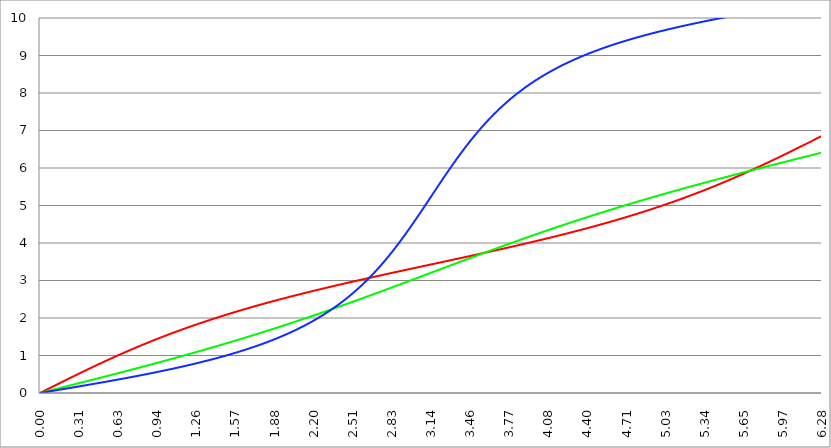
| Category | Series 1 | Series 0 | Series 2 |
|---|---|---|---|
| 0.0 | 0 | 0 | 0 |
| 0.00314159265358979 | 0.005 | 0.003 | 0.002 |
| 0.00628318530717958 | 0.01 | 0.005 | 0.003 |
| 0.00942477796076938 | 0.016 | 0.008 | 0.005 |
| 0.0125663706143592 | 0.021 | 0.01 | 0.007 |
| 0.015707963267949 | 0.026 | 0.013 | 0.009 |
| 0.0188495559215388 | 0.031 | 0.016 | 0.01 |
| 0.0219911485751285 | 0.037 | 0.018 | 0.012 |
| 0.0251327412287183 | 0.042 | 0.021 | 0.014 |
| 0.0282743338823081 | 0.047 | 0.024 | 0.016 |
| 0.0314159265358979 | 0.052 | 0.026 | 0.017 |
| 0.0345575191894877 | 0.058 | 0.029 | 0.019 |
| 0.0376991118430775 | 0.063 | 0.031 | 0.021 |
| 0.0408407044966673 | 0.068 | 0.034 | 0.023 |
| 0.0439822971502571 | 0.073 | 0.037 | 0.024 |
| 0.0471238898038469 | 0.079 | 0.039 | 0.026 |
| 0.0502654824574367 | 0.084 | 0.042 | 0.028 |
| 0.0534070751110265 | 0.089 | 0.045 | 0.03 |
| 0.0565486677646163 | 0.094 | 0.047 | 0.031 |
| 0.059690260418206 | 0.099 | 0.05 | 0.033 |
| 0.0628318530717958 | 0.105 | 0.052 | 0.035 |
| 0.0659734457253856 | 0.11 | 0.055 | 0.037 |
| 0.0691150383789754 | 0.115 | 0.058 | 0.038 |
| 0.0722566310325652 | 0.12 | 0.06 | 0.04 |
| 0.075398223686155 | 0.126 | 0.063 | 0.042 |
| 0.0785398163397448 | 0.131 | 0.065 | 0.044 |
| 0.0816814089933346 | 0.136 | 0.068 | 0.045 |
| 0.0848230016469244 | 0.141 | 0.071 | 0.047 |
| 0.0879645943005142 | 0.146 | 0.073 | 0.049 |
| 0.091106186954104 | 0.152 | 0.076 | 0.051 |
| 0.0942477796076937 | 0.157 | 0.079 | 0.052 |
| 0.0973893722612835 | 0.162 | 0.081 | 0.054 |
| 0.100530964914873 | 0.167 | 0.084 | 0.056 |
| 0.103672557568463 | 0.173 | 0.086 | 0.058 |
| 0.106814150222053 | 0.178 | 0.089 | 0.059 |
| 0.109955742875643 | 0.183 | 0.092 | 0.061 |
| 0.113097335529233 | 0.188 | 0.094 | 0.063 |
| 0.116238928182822 | 0.193 | 0.097 | 0.065 |
| 0.119380520836412 | 0.199 | 0.1 | 0.066 |
| 0.122522113490002 | 0.204 | 0.102 | 0.068 |
| 0.125663706143592 | 0.209 | 0.105 | 0.07 |
| 0.128805298797181 | 0.214 | 0.107 | 0.072 |
| 0.131946891450771 | 0.219 | 0.11 | 0.073 |
| 0.135088484104361 | 0.225 | 0.113 | 0.075 |
| 0.138230076757951 | 0.23 | 0.115 | 0.077 |
| 0.141371669411541 | 0.235 | 0.118 | 0.079 |
| 0.14451326206513 | 0.24 | 0.12 | 0.08 |
| 0.14765485471872 | 0.245 | 0.123 | 0.082 |
| 0.15079644737231 | 0.251 | 0.126 | 0.084 |
| 0.1539380400259 | 0.256 | 0.128 | 0.086 |
| 0.15707963267949 | 0.261 | 0.131 | 0.087 |
| 0.160221225333079 | 0.266 | 0.134 | 0.089 |
| 0.163362817986669 | 0.271 | 0.136 | 0.091 |
| 0.166504410640259 | 0.277 | 0.139 | 0.093 |
| 0.169646003293849 | 0.282 | 0.141 | 0.094 |
| 0.172787595947439 | 0.287 | 0.144 | 0.096 |
| 0.175929188601028 | 0.292 | 0.147 | 0.098 |
| 0.179070781254618 | 0.297 | 0.149 | 0.1 |
| 0.182212373908208 | 0.303 | 0.152 | 0.101 |
| 0.185353966561798 | 0.308 | 0.155 | 0.103 |
| 0.188495559215388 | 0.313 | 0.157 | 0.105 |
| 0.191637151868977 | 0.318 | 0.16 | 0.107 |
| 0.194778744522567 | 0.323 | 0.162 | 0.109 |
| 0.197920337176157 | 0.328 | 0.165 | 0.11 |
| 0.201061929829747 | 0.334 | 0.168 | 0.112 |
| 0.204203522483336 | 0.339 | 0.17 | 0.114 |
| 0.207345115136926 | 0.344 | 0.173 | 0.116 |
| 0.210486707790516 | 0.349 | 0.176 | 0.117 |
| 0.213628300444106 | 0.354 | 0.178 | 0.119 |
| 0.216769893097696 | 0.359 | 0.181 | 0.121 |
| 0.219911485751285 | 0.365 | 0.184 | 0.123 |
| 0.223053078404875 | 0.37 | 0.186 | 0.124 |
| 0.226194671058465 | 0.375 | 0.189 | 0.126 |
| 0.229336263712055 | 0.38 | 0.191 | 0.128 |
| 0.232477856365645 | 0.385 | 0.194 | 0.13 |
| 0.235619449019234 | 0.39 | 0.197 | 0.131 |
| 0.238761041672824 | 0.395 | 0.199 | 0.133 |
| 0.241902634326414 | 0.401 | 0.202 | 0.135 |
| 0.245044226980004 | 0.406 | 0.205 | 0.137 |
| 0.248185819633594 | 0.411 | 0.207 | 0.139 |
| 0.251327412287183 | 0.416 | 0.21 | 0.14 |
| 0.254469004940773 | 0.421 | 0.212 | 0.142 |
| 0.257610597594363 | 0.426 | 0.215 | 0.144 |
| 0.260752190247953 | 0.431 | 0.218 | 0.146 |
| 0.263893782901543 | 0.436 | 0.22 | 0.147 |
| 0.267035375555132 | 0.442 | 0.223 | 0.149 |
| 0.270176968208722 | 0.447 | 0.226 | 0.151 |
| 0.273318560862312 | 0.452 | 0.228 | 0.153 |
| 0.276460153515902 | 0.457 | 0.231 | 0.154 |
| 0.279601746169492 | 0.462 | 0.234 | 0.156 |
| 0.282743338823082 | 0.467 | 0.236 | 0.158 |
| 0.285884931476671 | 0.472 | 0.239 | 0.16 |
| 0.289026524130261 | 0.477 | 0.241 | 0.162 |
| 0.292168116783851 | 0.482 | 0.244 | 0.163 |
| 0.295309709437441 | 0.488 | 0.247 | 0.165 |
| 0.298451302091031 | 0.493 | 0.249 | 0.167 |
| 0.30159289474462 | 0.498 | 0.252 | 0.169 |
| 0.30473448739821 | 0.503 | 0.255 | 0.17 |
| 0.3078760800518 | 0.508 | 0.257 | 0.172 |
| 0.31101767270539 | 0.513 | 0.26 | 0.174 |
| 0.31415926535898 | 0.518 | 0.263 | 0.176 |
| 0.31730085801257 | 0.523 | 0.265 | 0.178 |
| 0.320442450666159 | 0.528 | 0.268 | 0.179 |
| 0.323584043319749 | 0.533 | 0.27 | 0.181 |
| 0.326725635973339 | 0.538 | 0.273 | 0.183 |
| 0.329867228626929 | 0.543 | 0.276 | 0.185 |
| 0.333008821280519 | 0.548 | 0.278 | 0.187 |
| 0.336150413934108 | 0.553 | 0.281 | 0.188 |
| 0.339292006587698 | 0.558 | 0.284 | 0.19 |
| 0.342433599241288 | 0.563 | 0.286 | 0.192 |
| 0.345575191894878 | 0.569 | 0.289 | 0.194 |
| 0.348716784548468 | 0.574 | 0.292 | 0.195 |
| 0.351858377202058 | 0.579 | 0.294 | 0.197 |
| 0.354999969855647 | 0.584 | 0.297 | 0.199 |
| 0.358141562509237 | 0.589 | 0.3 | 0.201 |
| 0.361283155162827 | 0.594 | 0.302 | 0.203 |
| 0.364424747816417 | 0.599 | 0.305 | 0.204 |
| 0.367566340470007 | 0.604 | 0.307 | 0.206 |
| 0.370707933123597 | 0.609 | 0.31 | 0.208 |
| 0.373849525777186 | 0.614 | 0.313 | 0.21 |
| 0.376991118430776 | 0.619 | 0.315 | 0.212 |
| 0.380132711084366 | 0.624 | 0.318 | 0.213 |
| 0.383274303737956 | 0.629 | 0.321 | 0.215 |
| 0.386415896391546 | 0.634 | 0.323 | 0.217 |
| 0.389557489045135 | 0.639 | 0.326 | 0.219 |
| 0.392699081698725 | 0.644 | 0.329 | 0.221 |
| 0.395840674352315 | 0.649 | 0.331 | 0.222 |
| 0.398982267005905 | 0.654 | 0.334 | 0.224 |
| 0.402123859659495 | 0.659 | 0.337 | 0.226 |
| 0.405265452313085 | 0.664 | 0.339 | 0.228 |
| 0.408407044966674 | 0.669 | 0.342 | 0.23 |
| 0.411548637620264 | 0.674 | 0.345 | 0.232 |
| 0.414690230273854 | 0.678 | 0.347 | 0.233 |
| 0.417831822927444 | 0.683 | 0.35 | 0.235 |
| 0.420973415581034 | 0.688 | 0.353 | 0.237 |
| 0.424115008234623 | 0.693 | 0.355 | 0.239 |
| 0.427256600888213 | 0.698 | 0.358 | 0.241 |
| 0.430398193541803 | 0.703 | 0.361 | 0.242 |
| 0.433539786195393 | 0.708 | 0.363 | 0.244 |
| 0.436681378848983 | 0.713 | 0.366 | 0.246 |
| 0.439822971502573 | 0.718 | 0.368 | 0.248 |
| 0.442964564156162 | 0.723 | 0.371 | 0.25 |
| 0.446106156809752 | 0.728 | 0.374 | 0.252 |
| 0.449247749463342 | 0.733 | 0.376 | 0.253 |
| 0.452389342116932 | 0.738 | 0.379 | 0.255 |
| 0.455530934770522 | 0.743 | 0.382 | 0.257 |
| 0.458672527424111 | 0.747 | 0.384 | 0.259 |
| 0.461814120077701 | 0.752 | 0.387 | 0.261 |
| 0.464955712731291 | 0.757 | 0.39 | 0.263 |
| 0.468097305384881 | 0.762 | 0.392 | 0.264 |
| 0.471238898038471 | 0.767 | 0.395 | 0.266 |
| 0.474380490692061 | 0.772 | 0.398 | 0.268 |
| 0.47752208334565 | 0.777 | 0.4 | 0.27 |
| 0.48066367599924 | 0.782 | 0.403 | 0.272 |
| 0.48380526865283 | 0.787 | 0.406 | 0.274 |
| 0.48694686130642 | 0.791 | 0.408 | 0.275 |
| 0.49008845396001 | 0.796 | 0.411 | 0.277 |
| 0.493230046613599 | 0.801 | 0.414 | 0.279 |
| 0.496371639267189 | 0.806 | 0.416 | 0.281 |
| 0.499513231920779 | 0.811 | 0.419 | 0.283 |
| 0.502654824574369 | 0.816 | 0.422 | 0.285 |
| 0.505796417227959 | 0.82 | 0.424 | 0.286 |
| 0.508938009881549 | 0.825 | 0.427 | 0.288 |
| 0.512079602535138 | 0.83 | 0.43 | 0.29 |
| 0.515221195188728 | 0.835 | 0.433 | 0.292 |
| 0.518362787842318 | 0.84 | 0.435 | 0.294 |
| 0.521504380495908 | 0.845 | 0.438 | 0.296 |
| 0.524645973149498 | 0.849 | 0.441 | 0.298 |
| 0.527787565803087 | 0.854 | 0.443 | 0.299 |
| 0.530929158456677 | 0.859 | 0.446 | 0.301 |
| 0.534070751110267 | 0.864 | 0.449 | 0.303 |
| 0.537212343763857 | 0.869 | 0.451 | 0.305 |
| 0.540353936417447 | 0.873 | 0.454 | 0.307 |
| 0.543495529071037 | 0.878 | 0.457 | 0.309 |
| 0.546637121724626 | 0.883 | 0.459 | 0.311 |
| 0.549778714378216 | 0.888 | 0.462 | 0.312 |
| 0.552920307031806 | 0.892 | 0.465 | 0.314 |
| 0.556061899685396 | 0.897 | 0.467 | 0.316 |
| 0.559203492338986 | 0.902 | 0.47 | 0.318 |
| 0.562345084992576 | 0.907 | 0.473 | 0.32 |
| 0.565486677646165 | 0.911 | 0.475 | 0.322 |
| 0.568628270299755 | 0.916 | 0.478 | 0.324 |
| 0.571769862953345 | 0.921 | 0.481 | 0.326 |
| 0.574911455606935 | 0.926 | 0.483 | 0.327 |
| 0.578053048260525 | 0.93 | 0.486 | 0.329 |
| 0.581194640914114 | 0.935 | 0.489 | 0.331 |
| 0.584336233567704 | 0.94 | 0.492 | 0.333 |
| 0.587477826221294 | 0.945 | 0.494 | 0.335 |
| 0.590619418874884 | 0.949 | 0.497 | 0.337 |
| 0.593761011528474 | 0.954 | 0.5 | 0.339 |
| 0.596902604182064 | 0.959 | 0.502 | 0.341 |
| 0.600044196835653 | 0.963 | 0.505 | 0.343 |
| 0.603185789489243 | 0.968 | 0.508 | 0.344 |
| 0.606327382142833 | 0.973 | 0.51 | 0.346 |
| 0.609468974796423 | 0.977 | 0.513 | 0.348 |
| 0.612610567450013 | 0.982 | 0.516 | 0.35 |
| 0.615752160103602 | 0.987 | 0.519 | 0.352 |
| 0.618893752757192 | 0.991 | 0.521 | 0.354 |
| 0.622035345410782 | 0.996 | 0.524 | 0.356 |
| 0.625176938064372 | 1.001 | 0.527 | 0.358 |
| 0.628318530717962 | 1.005 | 0.529 | 0.36 |
| 0.631460123371551 | 1.01 | 0.532 | 0.362 |
| 0.634601716025141 | 1.015 | 0.535 | 0.363 |
| 0.637743308678731 | 1.019 | 0.537 | 0.365 |
| 0.640884901332321 | 1.024 | 0.54 | 0.367 |
| 0.644026493985911 | 1.028 | 0.543 | 0.369 |
| 0.647168086639501 | 1.033 | 0.546 | 0.371 |
| 0.65030967929309 | 1.038 | 0.548 | 0.373 |
| 0.65345127194668 | 1.042 | 0.551 | 0.375 |
| 0.65659286460027 | 1.047 | 0.554 | 0.377 |
| 0.65973445725386 | 1.052 | 0.556 | 0.379 |
| 0.66287604990745 | 1.056 | 0.559 | 0.381 |
| 0.666017642561039 | 1.061 | 0.562 | 0.383 |
| 0.669159235214629 | 1.065 | 0.565 | 0.385 |
| 0.672300827868219 | 1.07 | 0.567 | 0.386 |
| 0.675442420521809 | 1.074 | 0.57 | 0.388 |
| 0.678584013175399 | 1.079 | 0.573 | 0.39 |
| 0.681725605828989 | 1.084 | 0.575 | 0.392 |
| 0.684867198482578 | 1.088 | 0.578 | 0.394 |
| 0.688008791136168 | 1.093 | 0.581 | 0.396 |
| 0.691150383789758 | 1.097 | 0.584 | 0.398 |
| 0.694291976443348 | 1.102 | 0.586 | 0.4 |
| 0.697433569096938 | 1.106 | 0.589 | 0.402 |
| 0.700575161750528 | 1.111 | 0.592 | 0.404 |
| 0.703716754404117 | 1.115 | 0.594 | 0.406 |
| 0.706858347057707 | 1.12 | 0.597 | 0.408 |
| 0.709999939711297 | 1.124 | 0.6 | 0.41 |
| 0.713141532364887 | 1.129 | 0.603 | 0.412 |
| 0.716283125018477 | 1.133 | 0.605 | 0.414 |
| 0.719424717672066 | 1.138 | 0.608 | 0.416 |
| 0.722566310325656 | 1.142 | 0.611 | 0.418 |
| 0.725707902979246 | 1.147 | 0.614 | 0.42 |
| 0.728849495632836 | 1.151 | 0.616 | 0.422 |
| 0.731991088286426 | 1.156 | 0.619 | 0.424 |
| 0.735132680940016 | 1.16 | 0.622 | 0.426 |
| 0.738274273593605 | 1.165 | 0.625 | 0.427 |
| 0.741415866247195 | 1.169 | 0.627 | 0.429 |
| 0.744557458900785 | 1.174 | 0.63 | 0.431 |
| 0.747699051554375 | 1.178 | 0.633 | 0.433 |
| 0.750840644207965 | 1.183 | 0.635 | 0.435 |
| 0.753982236861554 | 1.187 | 0.638 | 0.437 |
| 0.757123829515144 | 1.191 | 0.641 | 0.439 |
| 0.760265422168734 | 1.196 | 0.644 | 0.441 |
| 0.763407014822324 | 1.2 | 0.646 | 0.443 |
| 0.766548607475914 | 1.205 | 0.649 | 0.445 |
| 0.769690200129504 | 1.209 | 0.652 | 0.447 |
| 0.772831792783093 | 1.213 | 0.655 | 0.449 |
| 0.775973385436683 | 1.218 | 0.657 | 0.451 |
| 0.779114978090273 | 1.222 | 0.66 | 0.453 |
| 0.782256570743863 | 1.227 | 0.663 | 0.455 |
| 0.785398163397453 | 1.231 | 0.666 | 0.457 |
| 0.788539756051042 | 1.235 | 0.668 | 0.459 |
| 0.791681348704632 | 1.24 | 0.671 | 0.461 |
| 0.794822941358222 | 1.244 | 0.674 | 0.463 |
| 0.797964534011812 | 1.249 | 0.677 | 0.465 |
| 0.801106126665402 | 1.253 | 0.679 | 0.467 |
| 0.804247719318992 | 1.257 | 0.682 | 0.469 |
| 0.807389311972581 | 1.262 | 0.685 | 0.471 |
| 0.810530904626171 | 1.266 | 0.688 | 0.473 |
| 0.813672497279761 | 1.27 | 0.691 | 0.475 |
| 0.816814089933351 | 1.275 | 0.693 | 0.478 |
| 0.819955682586941 | 1.279 | 0.696 | 0.48 |
| 0.823097275240531 | 1.283 | 0.699 | 0.482 |
| 0.82623886789412 | 1.288 | 0.702 | 0.484 |
| 0.82938046054771 | 1.292 | 0.704 | 0.486 |
| 0.8325220532013 | 1.296 | 0.707 | 0.488 |
| 0.83566364585489 | 1.3 | 0.71 | 0.49 |
| 0.83880523850848 | 1.305 | 0.713 | 0.492 |
| 0.841946831162069 | 1.309 | 0.715 | 0.494 |
| 0.845088423815659 | 1.313 | 0.718 | 0.496 |
| 0.848230016469249 | 1.318 | 0.721 | 0.498 |
| 0.851371609122839 | 1.322 | 0.724 | 0.5 |
| 0.854513201776429 | 1.326 | 0.727 | 0.502 |
| 0.857654794430019 | 1.33 | 0.729 | 0.504 |
| 0.860796387083608 | 1.335 | 0.732 | 0.506 |
| 0.863937979737198 | 1.339 | 0.735 | 0.508 |
| 0.867079572390788 | 1.343 | 0.738 | 0.51 |
| 0.870221165044378 | 1.347 | 0.74 | 0.512 |
| 0.873362757697968 | 1.352 | 0.743 | 0.514 |
| 0.876504350351557 | 1.356 | 0.746 | 0.517 |
| 0.879645943005147 | 1.36 | 0.749 | 0.519 |
| 0.882787535658737 | 1.364 | 0.752 | 0.521 |
| 0.885929128312327 | 1.368 | 0.754 | 0.523 |
| 0.889070720965917 | 1.373 | 0.757 | 0.525 |
| 0.892212313619507 | 1.377 | 0.76 | 0.527 |
| 0.895353906273096 | 1.381 | 0.763 | 0.529 |
| 0.898495498926686 | 1.385 | 0.766 | 0.531 |
| 0.901637091580276 | 1.389 | 0.768 | 0.533 |
| 0.904778684233866 | 1.394 | 0.771 | 0.535 |
| 0.907920276887456 | 1.398 | 0.774 | 0.537 |
| 0.911061869541045 | 1.402 | 0.777 | 0.54 |
| 0.914203462194635 | 1.406 | 0.78 | 0.542 |
| 0.917345054848225 | 1.41 | 0.782 | 0.544 |
| 0.920486647501815 | 1.414 | 0.785 | 0.546 |
| 0.923628240155405 | 1.419 | 0.788 | 0.548 |
| 0.926769832808995 | 1.423 | 0.791 | 0.55 |
| 0.929911425462584 | 1.427 | 0.794 | 0.552 |
| 0.933053018116174 | 1.431 | 0.796 | 0.554 |
| 0.936194610769764 | 1.435 | 0.799 | 0.557 |
| 0.939336203423354 | 1.439 | 0.802 | 0.559 |
| 0.942477796076944 | 1.443 | 0.805 | 0.561 |
| 0.945619388730533 | 1.447 | 0.808 | 0.563 |
| 0.948760981384123 | 1.451 | 0.81 | 0.565 |
| 0.951902574037713 | 1.456 | 0.813 | 0.567 |
| 0.955044166691303 | 1.46 | 0.816 | 0.569 |
| 0.958185759344893 | 1.464 | 0.819 | 0.572 |
| 0.961327351998483 | 1.468 | 0.822 | 0.574 |
| 0.964468944652072 | 1.472 | 0.824 | 0.576 |
| 0.967610537305662 | 1.476 | 0.827 | 0.578 |
| 0.970752129959252 | 1.48 | 0.83 | 0.58 |
| 0.973893722612842 | 1.484 | 0.833 | 0.582 |
| 0.977035315266432 | 1.488 | 0.836 | 0.584 |
| 0.980176907920022 | 1.492 | 0.839 | 0.587 |
| 0.983318500573611 | 1.496 | 0.841 | 0.589 |
| 0.986460093227201 | 1.5 | 0.844 | 0.591 |
| 0.989601685880791 | 1.504 | 0.847 | 0.593 |
| 0.992743278534381 | 1.508 | 0.85 | 0.595 |
| 0.995884871187971 | 1.512 | 0.853 | 0.598 |
| 0.99902646384156 | 1.516 | 0.856 | 0.6 |
| 1.00216805649515 | 1.52 | 0.858 | 0.602 |
| 1.00530964914874 | 1.524 | 0.861 | 0.604 |
| 1.00845124180233 | 1.528 | 0.864 | 0.606 |
| 1.01159283445592 | 1.532 | 0.867 | 0.609 |
| 1.01473442710951 | 1.536 | 0.87 | 0.611 |
| 1.017876019763099 | 1.54 | 0.873 | 0.613 |
| 1.021017612416689 | 1.544 | 0.875 | 0.615 |
| 1.02415920507028 | 1.548 | 0.878 | 0.617 |
| 1.027300797723869 | 1.552 | 0.881 | 0.62 |
| 1.030442390377459 | 1.556 | 0.884 | 0.622 |
| 1.033583983031048 | 1.56 | 0.887 | 0.624 |
| 1.036725575684638 | 1.564 | 0.89 | 0.626 |
| 1.039867168338228 | 1.568 | 0.893 | 0.629 |
| 1.043008760991818 | 1.572 | 0.895 | 0.631 |
| 1.046150353645408 | 1.576 | 0.898 | 0.633 |
| 1.049291946298998 | 1.58 | 0.901 | 0.635 |
| 1.052433538952587 | 1.584 | 0.904 | 0.637 |
| 1.055575131606177 | 1.588 | 0.907 | 0.64 |
| 1.058716724259767 | 1.591 | 0.91 | 0.642 |
| 1.061858316913357 | 1.595 | 0.913 | 0.644 |
| 1.064999909566947 | 1.599 | 0.915 | 0.647 |
| 1.068141502220536 | 1.603 | 0.918 | 0.649 |
| 1.071283094874126 | 1.607 | 0.921 | 0.651 |
| 1.074424687527716 | 1.611 | 0.924 | 0.653 |
| 1.077566280181306 | 1.615 | 0.927 | 0.656 |
| 1.080707872834896 | 1.619 | 0.93 | 0.658 |
| 1.083849465488486 | 1.623 | 0.933 | 0.66 |
| 1.086991058142075 | 1.626 | 0.935 | 0.662 |
| 1.090132650795665 | 1.63 | 0.938 | 0.665 |
| 1.093274243449255 | 1.634 | 0.941 | 0.667 |
| 1.096415836102845 | 1.638 | 0.944 | 0.669 |
| 1.099557428756435 | 1.642 | 0.947 | 0.672 |
| 1.102699021410025 | 1.646 | 0.95 | 0.674 |
| 1.105840614063614 | 1.65 | 0.953 | 0.676 |
| 1.108982206717204 | 1.653 | 0.956 | 0.679 |
| 1.112123799370794 | 1.657 | 0.959 | 0.681 |
| 1.115265392024384 | 1.661 | 0.961 | 0.683 |
| 1.118406984677974 | 1.665 | 0.964 | 0.686 |
| 1.121548577331563 | 1.669 | 0.967 | 0.688 |
| 1.124690169985153 | 1.672 | 0.97 | 0.69 |
| 1.127831762638743 | 1.676 | 0.973 | 0.693 |
| 1.130973355292333 | 1.68 | 0.976 | 0.695 |
| 1.134114947945923 | 1.684 | 0.979 | 0.697 |
| 1.137256540599513 | 1.688 | 0.982 | 0.7 |
| 1.140398133253102 | 1.691 | 0.985 | 0.702 |
| 1.143539725906692 | 1.695 | 0.987 | 0.704 |
| 1.146681318560282 | 1.699 | 0.99 | 0.707 |
| 1.149822911213872 | 1.703 | 0.993 | 0.709 |
| 1.152964503867462 | 1.706 | 0.996 | 0.711 |
| 1.156106096521051 | 1.71 | 0.999 | 0.714 |
| 1.159247689174641 | 1.714 | 1.002 | 0.716 |
| 1.162389281828231 | 1.718 | 1.005 | 0.719 |
| 1.165530874481821 | 1.721 | 1.008 | 0.721 |
| 1.168672467135411 | 1.725 | 1.011 | 0.723 |
| 1.171814059789001 | 1.729 | 1.014 | 0.726 |
| 1.17495565244259 | 1.732 | 1.017 | 0.728 |
| 1.17809724509618 | 1.736 | 1.019 | 0.73 |
| 1.18123883774977 | 1.74 | 1.022 | 0.733 |
| 1.18438043040336 | 1.744 | 1.025 | 0.735 |
| 1.18752202305695 | 1.747 | 1.028 | 0.738 |
| 1.190663615710539 | 1.751 | 1.031 | 0.74 |
| 1.193805208364129 | 1.755 | 1.034 | 0.743 |
| 1.19694680101772 | 1.758 | 1.037 | 0.745 |
| 1.200088393671309 | 1.762 | 1.04 | 0.747 |
| 1.203229986324899 | 1.766 | 1.043 | 0.75 |
| 1.206371578978489 | 1.769 | 1.046 | 0.752 |
| 1.209513171632078 | 1.773 | 1.049 | 0.755 |
| 1.212654764285668 | 1.777 | 1.052 | 0.757 |
| 1.215796356939258 | 1.78 | 1.055 | 0.76 |
| 1.218937949592848 | 1.784 | 1.058 | 0.762 |
| 1.222079542246438 | 1.788 | 1.06 | 0.765 |
| 1.225221134900027 | 1.791 | 1.063 | 0.767 |
| 1.228362727553617 | 1.795 | 1.066 | 0.77 |
| 1.231504320207207 | 1.799 | 1.069 | 0.772 |
| 1.234645912860797 | 1.802 | 1.072 | 0.775 |
| 1.237787505514387 | 1.806 | 1.075 | 0.777 |
| 1.240929098167977 | 1.809 | 1.078 | 0.779 |
| 1.244070690821566 | 1.813 | 1.081 | 0.782 |
| 1.247212283475156 | 1.817 | 1.084 | 0.784 |
| 1.250353876128746 | 1.82 | 1.087 | 0.787 |
| 1.253495468782336 | 1.824 | 1.09 | 0.79 |
| 1.256637061435926 | 1.827 | 1.093 | 0.792 |
| 1.259778654089515 | 1.831 | 1.096 | 0.795 |
| 1.262920246743105 | 1.835 | 1.099 | 0.797 |
| 1.266061839396695 | 1.838 | 1.102 | 0.8 |
| 1.269203432050285 | 1.842 | 1.105 | 0.802 |
| 1.272345024703875 | 1.845 | 1.108 | 0.805 |
| 1.275486617357465 | 1.849 | 1.111 | 0.807 |
| 1.278628210011054 | 1.852 | 1.114 | 0.81 |
| 1.281769802664644 | 1.856 | 1.117 | 0.812 |
| 1.284911395318234 | 1.859 | 1.12 | 0.815 |
| 1.288052987971824 | 1.863 | 1.123 | 0.817 |
| 1.291194580625414 | 1.866 | 1.126 | 0.82 |
| 1.294336173279003 | 1.87 | 1.129 | 0.823 |
| 1.297477765932593 | 1.874 | 1.132 | 0.825 |
| 1.300619358586183 | 1.877 | 1.135 | 0.828 |
| 1.303760951239773 | 1.881 | 1.137 | 0.83 |
| 1.306902543893363 | 1.884 | 1.14 | 0.833 |
| 1.310044136546953 | 1.888 | 1.143 | 0.836 |
| 1.313185729200542 | 1.891 | 1.146 | 0.838 |
| 1.316327321854132 | 1.895 | 1.149 | 0.841 |
| 1.319468914507722 | 1.898 | 1.152 | 0.843 |
| 1.322610507161312 | 1.902 | 1.155 | 0.846 |
| 1.325752099814902 | 1.905 | 1.158 | 0.849 |
| 1.328893692468491 | 1.909 | 1.161 | 0.851 |
| 1.332035285122081 | 1.912 | 1.164 | 0.854 |
| 1.335176877775671 | 1.915 | 1.167 | 0.857 |
| 1.338318470429261 | 1.919 | 1.17 | 0.859 |
| 1.341460063082851 | 1.922 | 1.173 | 0.862 |
| 1.344601655736441 | 1.926 | 1.176 | 0.865 |
| 1.34774324839003 | 1.929 | 1.179 | 0.867 |
| 1.35088484104362 | 1.933 | 1.182 | 0.87 |
| 1.35402643369721 | 1.936 | 1.185 | 0.873 |
| 1.3571680263508 | 1.94 | 1.188 | 0.875 |
| 1.36030961900439 | 1.943 | 1.191 | 0.878 |
| 1.363451211657979 | 1.946 | 1.195 | 0.881 |
| 1.36659280431157 | 1.95 | 1.198 | 0.883 |
| 1.369734396965159 | 1.953 | 1.201 | 0.886 |
| 1.372875989618749 | 1.957 | 1.204 | 0.889 |
| 1.376017582272339 | 1.96 | 1.207 | 0.891 |
| 1.379159174925929 | 1.964 | 1.21 | 0.894 |
| 1.382300767579518 | 1.967 | 1.213 | 0.897 |
| 1.385442360233108 | 1.97 | 1.216 | 0.9 |
| 1.388583952886698 | 1.974 | 1.219 | 0.902 |
| 1.391725545540288 | 1.977 | 1.222 | 0.905 |
| 1.394867138193878 | 1.98 | 1.225 | 0.908 |
| 1.398008730847468 | 1.984 | 1.228 | 0.911 |
| 1.401150323501057 | 1.987 | 1.231 | 0.913 |
| 1.404291916154647 | 1.991 | 1.234 | 0.916 |
| 1.407433508808237 | 1.994 | 1.237 | 0.919 |
| 1.410575101461827 | 1.997 | 1.24 | 0.922 |
| 1.413716694115417 | 2.001 | 1.243 | 0.925 |
| 1.416858286769006 | 2.004 | 1.246 | 0.927 |
| 1.419999879422596 | 2.007 | 1.249 | 0.93 |
| 1.423141472076186 | 2.011 | 1.252 | 0.933 |
| 1.426283064729776 | 2.014 | 1.255 | 0.936 |
| 1.429424657383366 | 2.017 | 1.258 | 0.939 |
| 1.432566250036956 | 2.021 | 1.261 | 0.941 |
| 1.435707842690545 | 2.024 | 1.264 | 0.944 |
| 1.438849435344135 | 2.027 | 1.267 | 0.947 |
| 1.441991027997725 | 2.031 | 1.271 | 0.95 |
| 1.445132620651315 | 2.034 | 1.274 | 0.953 |
| 1.448274213304905 | 2.037 | 1.277 | 0.956 |
| 1.451415805958494 | 2.041 | 1.28 | 0.958 |
| 1.454557398612084 | 2.044 | 1.283 | 0.961 |
| 1.457698991265674 | 2.047 | 1.286 | 0.964 |
| 1.460840583919264 | 2.05 | 1.289 | 0.967 |
| 1.463982176572854 | 2.054 | 1.292 | 0.97 |
| 1.467123769226444 | 2.057 | 1.295 | 0.973 |
| 1.470265361880033 | 2.06 | 1.298 | 0.976 |
| 1.473406954533623 | 2.064 | 1.301 | 0.979 |
| 1.476548547187213 | 2.067 | 1.304 | 0.982 |
| 1.479690139840803 | 2.07 | 1.307 | 0.985 |
| 1.482831732494393 | 2.073 | 1.31 | 0.987 |
| 1.485973325147982 | 2.077 | 1.314 | 0.99 |
| 1.489114917801572 | 2.08 | 1.317 | 0.993 |
| 1.492256510455162 | 2.083 | 1.32 | 0.996 |
| 1.495398103108752 | 2.086 | 1.323 | 0.999 |
| 1.498539695762342 | 2.09 | 1.326 | 1.002 |
| 1.501681288415932 | 2.093 | 1.329 | 1.005 |
| 1.504822881069521 | 2.096 | 1.332 | 1.008 |
| 1.507964473723111 | 2.099 | 1.335 | 1.011 |
| 1.511106066376701 | 2.102 | 1.338 | 1.014 |
| 1.514247659030291 | 2.106 | 1.341 | 1.017 |
| 1.517389251683881 | 2.109 | 1.345 | 1.02 |
| 1.520530844337471 | 2.112 | 1.348 | 1.023 |
| 1.52367243699106 | 2.115 | 1.351 | 1.026 |
| 1.52681402964465 | 2.119 | 1.354 | 1.029 |
| 1.52995562229824 | 2.122 | 1.357 | 1.032 |
| 1.53309721495183 | 2.125 | 1.36 | 1.035 |
| 1.53623880760542 | 2.128 | 1.363 | 1.038 |
| 1.539380400259009 | 2.131 | 1.366 | 1.041 |
| 1.542521992912599 | 2.134 | 1.369 | 1.045 |
| 1.545663585566189 | 2.138 | 1.373 | 1.048 |
| 1.548805178219779 | 2.141 | 1.376 | 1.051 |
| 1.551946770873369 | 2.144 | 1.379 | 1.054 |
| 1.555088363526959 | 2.147 | 1.382 | 1.057 |
| 1.558229956180548 | 2.15 | 1.385 | 1.06 |
| 1.561371548834138 | 2.153 | 1.388 | 1.063 |
| 1.564513141487728 | 2.157 | 1.391 | 1.066 |
| 1.567654734141318 | 2.16 | 1.395 | 1.069 |
| 1.570796326794908 | 2.163 | 1.398 | 1.073 |
| 1.573937919448497 | 2.166 | 1.401 | 1.076 |
| 1.577079512102087 | 2.169 | 1.404 | 1.079 |
| 1.580221104755677 | 2.172 | 1.407 | 1.082 |
| 1.583362697409267 | 2.175 | 1.41 | 1.085 |
| 1.586504290062857 | 2.179 | 1.413 | 1.088 |
| 1.589645882716447 | 2.182 | 1.417 | 1.091 |
| 1.592787475370036 | 2.185 | 1.42 | 1.095 |
| 1.595929068023626 | 2.188 | 1.423 | 1.098 |
| 1.599070660677216 | 2.191 | 1.426 | 1.101 |
| 1.602212253330806 | 2.194 | 1.429 | 1.104 |
| 1.605353845984396 | 2.197 | 1.432 | 1.108 |
| 1.608495438637985 | 2.2 | 1.436 | 1.111 |
| 1.611637031291575 | 2.203 | 1.439 | 1.114 |
| 1.614778623945165 | 2.206 | 1.442 | 1.117 |
| 1.617920216598755 | 2.21 | 1.445 | 1.121 |
| 1.621061809252345 | 2.213 | 1.448 | 1.124 |
| 1.624203401905935 | 2.216 | 1.451 | 1.127 |
| 1.627344994559524 | 2.219 | 1.455 | 1.13 |
| 1.630486587213114 | 2.222 | 1.458 | 1.134 |
| 1.633628179866704 | 2.225 | 1.461 | 1.137 |
| 1.636769772520294 | 2.228 | 1.464 | 1.14 |
| 1.639911365173884 | 2.231 | 1.467 | 1.144 |
| 1.643052957827473 | 2.234 | 1.47 | 1.147 |
| 1.646194550481063 | 2.237 | 1.474 | 1.15 |
| 1.649336143134653 | 2.24 | 1.477 | 1.154 |
| 1.652477735788243 | 2.243 | 1.48 | 1.157 |
| 1.655619328441833 | 2.246 | 1.483 | 1.16 |
| 1.658760921095423 | 2.249 | 1.486 | 1.164 |
| 1.661902513749012 | 2.252 | 1.49 | 1.167 |
| 1.665044106402602 | 2.255 | 1.493 | 1.17 |
| 1.668185699056192 | 2.258 | 1.496 | 1.174 |
| 1.671327291709782 | 2.261 | 1.499 | 1.177 |
| 1.674468884363372 | 2.264 | 1.502 | 1.181 |
| 1.677610477016961 | 2.267 | 1.506 | 1.184 |
| 1.680752069670551 | 2.27 | 1.509 | 1.188 |
| 1.683893662324141 | 2.273 | 1.512 | 1.191 |
| 1.687035254977731 | 2.277 | 1.515 | 1.194 |
| 1.690176847631321 | 2.28 | 1.519 | 1.198 |
| 1.693318440284911 | 2.282 | 1.522 | 1.201 |
| 1.6964600329385 | 2.285 | 1.525 | 1.205 |
| 1.69960162559209 | 2.288 | 1.528 | 1.208 |
| 1.70274321824568 | 2.291 | 1.531 | 1.212 |
| 1.70588481089927 | 2.294 | 1.535 | 1.215 |
| 1.70902640355286 | 2.297 | 1.538 | 1.219 |
| 1.712167996206449 | 2.3 | 1.541 | 1.223 |
| 1.715309588860039 | 2.303 | 1.544 | 1.226 |
| 1.71845118151363 | 2.306 | 1.548 | 1.23 |
| 1.721592774167219 | 2.309 | 1.551 | 1.233 |
| 1.724734366820809 | 2.312 | 1.554 | 1.237 |
| 1.727875959474399 | 2.315 | 1.557 | 1.24 |
| 1.731017552127988 | 2.318 | 1.561 | 1.244 |
| 1.734159144781578 | 2.321 | 1.564 | 1.248 |
| 1.737300737435168 | 2.324 | 1.567 | 1.251 |
| 1.740442330088758 | 2.327 | 1.57 | 1.255 |
| 1.743583922742348 | 2.33 | 1.574 | 1.258 |
| 1.746725515395937 | 2.333 | 1.577 | 1.262 |
| 1.749867108049527 | 2.336 | 1.58 | 1.266 |
| 1.753008700703117 | 2.339 | 1.583 | 1.269 |
| 1.756150293356707 | 2.342 | 1.587 | 1.273 |
| 1.759291886010297 | 2.345 | 1.59 | 1.277 |
| 1.762433478663887 | 2.348 | 1.593 | 1.28 |
| 1.765575071317476 | 2.35 | 1.596 | 1.284 |
| 1.768716663971066 | 2.353 | 1.6 | 1.288 |
| 1.771858256624656 | 2.356 | 1.603 | 1.292 |
| 1.774999849278246 | 2.359 | 1.606 | 1.295 |
| 1.778141441931836 | 2.362 | 1.609 | 1.299 |
| 1.781283034585426 | 2.365 | 1.613 | 1.303 |
| 1.784424627239015 | 2.368 | 1.616 | 1.307 |
| 1.787566219892605 | 2.371 | 1.619 | 1.31 |
| 1.790707812546195 | 2.374 | 1.623 | 1.314 |
| 1.793849405199785 | 2.377 | 1.626 | 1.318 |
| 1.796990997853375 | 2.379 | 1.629 | 1.322 |
| 1.800132590506964 | 2.382 | 1.632 | 1.326 |
| 1.803274183160554 | 2.385 | 1.636 | 1.33 |
| 1.806415775814144 | 2.388 | 1.639 | 1.333 |
| 1.809557368467734 | 2.391 | 1.642 | 1.337 |
| 1.812698961121324 | 2.394 | 1.646 | 1.341 |
| 1.815840553774914 | 2.397 | 1.649 | 1.345 |
| 1.818982146428503 | 2.4 | 1.652 | 1.349 |
| 1.822123739082093 | 2.402 | 1.656 | 1.353 |
| 1.825265331735683 | 2.405 | 1.659 | 1.357 |
| 1.828406924389273 | 2.408 | 1.662 | 1.361 |
| 1.831548517042863 | 2.411 | 1.665 | 1.365 |
| 1.834690109696452 | 2.414 | 1.669 | 1.369 |
| 1.837831702350042 | 2.417 | 1.672 | 1.373 |
| 1.840973295003632 | 2.42 | 1.675 | 1.377 |
| 1.844114887657222 | 2.422 | 1.679 | 1.381 |
| 1.847256480310812 | 2.425 | 1.682 | 1.385 |
| 1.850398072964402 | 2.428 | 1.685 | 1.389 |
| 1.853539665617991 | 2.431 | 1.689 | 1.393 |
| 1.856681258271581 | 2.434 | 1.692 | 1.397 |
| 1.859822850925171 | 2.436 | 1.695 | 1.401 |
| 1.862964443578761 | 2.439 | 1.699 | 1.405 |
| 1.866106036232351 | 2.442 | 1.702 | 1.409 |
| 1.86924762888594 | 2.445 | 1.705 | 1.413 |
| 1.87238922153953 | 2.448 | 1.709 | 1.417 |
| 1.87553081419312 | 2.451 | 1.712 | 1.421 |
| 1.87867240684671 | 2.453 | 1.715 | 1.425 |
| 1.8818139995003 | 2.456 | 1.719 | 1.43 |
| 1.88495559215389 | 2.459 | 1.722 | 1.434 |
| 1.888097184807479 | 2.462 | 1.725 | 1.438 |
| 1.891238777461069 | 2.465 | 1.729 | 1.442 |
| 1.89438037011466 | 2.467 | 1.732 | 1.446 |
| 1.897521962768249 | 2.47 | 1.735 | 1.451 |
| 1.900663555421839 | 2.473 | 1.739 | 1.455 |
| 1.903805148075429 | 2.476 | 1.742 | 1.459 |
| 1.906946740729018 | 2.478 | 1.746 | 1.463 |
| 1.910088333382608 | 2.481 | 1.749 | 1.468 |
| 1.913229926036198 | 2.484 | 1.752 | 1.472 |
| 1.916371518689788 | 2.487 | 1.756 | 1.476 |
| 1.919513111343378 | 2.49 | 1.759 | 1.481 |
| 1.922654703996967 | 2.492 | 1.762 | 1.485 |
| 1.925796296650557 | 2.495 | 1.766 | 1.489 |
| 1.928937889304147 | 2.498 | 1.769 | 1.494 |
| 1.932079481957737 | 2.501 | 1.773 | 1.498 |
| 1.935221074611327 | 2.503 | 1.776 | 1.502 |
| 1.938362667264917 | 2.506 | 1.779 | 1.507 |
| 1.941504259918506 | 2.509 | 1.783 | 1.511 |
| 1.944645852572096 | 2.512 | 1.786 | 1.516 |
| 1.947787445225686 | 2.514 | 1.789 | 1.52 |
| 1.950929037879276 | 2.517 | 1.793 | 1.524 |
| 1.954070630532866 | 2.52 | 1.796 | 1.529 |
| 1.957212223186455 | 2.522 | 1.8 | 1.533 |
| 1.960353815840045 | 2.525 | 1.803 | 1.538 |
| 1.963495408493635 | 2.528 | 1.806 | 1.542 |
| 1.966637001147225 | 2.531 | 1.81 | 1.547 |
| 1.969778593800815 | 2.533 | 1.813 | 1.552 |
| 1.972920186454405 | 2.536 | 1.817 | 1.556 |
| 1.976061779107994 | 2.539 | 1.82 | 1.561 |
| 1.979203371761584 | 2.542 | 1.823 | 1.565 |
| 1.982344964415174 | 2.544 | 1.827 | 1.57 |
| 1.985486557068764 | 2.547 | 1.83 | 1.575 |
| 1.988628149722354 | 2.55 | 1.834 | 1.579 |
| 1.991769742375943 | 2.552 | 1.837 | 1.584 |
| 1.994911335029533 | 2.555 | 1.841 | 1.589 |
| 1.998052927683123 | 2.558 | 1.844 | 1.593 |
| 2.001194520336712 | 2.56 | 1.847 | 1.598 |
| 2.004336112990302 | 2.563 | 1.851 | 1.603 |
| 2.007477705643892 | 2.566 | 1.854 | 1.607 |
| 2.010619298297482 | 2.569 | 1.858 | 1.612 |
| 2.013760890951071 | 2.571 | 1.861 | 1.617 |
| 2.016902483604661 | 2.574 | 1.865 | 1.622 |
| 2.02004407625825 | 2.577 | 1.868 | 1.627 |
| 2.02318566891184 | 2.579 | 1.871 | 1.631 |
| 2.02632726156543 | 2.582 | 1.875 | 1.636 |
| 2.029468854219019 | 2.585 | 1.878 | 1.641 |
| 2.032610446872609 | 2.587 | 1.882 | 1.646 |
| 2.035752039526198 | 2.59 | 1.885 | 1.651 |
| 2.038893632179788 | 2.593 | 1.889 | 1.656 |
| 2.042035224833378 | 2.595 | 1.892 | 1.661 |
| 2.045176817486967 | 2.598 | 1.896 | 1.666 |
| 2.048318410140557 | 2.601 | 1.899 | 1.671 |
| 2.051460002794146 | 2.603 | 1.903 | 1.676 |
| 2.054601595447736 | 2.606 | 1.906 | 1.68 |
| 2.057743188101325 | 2.608 | 1.909 | 1.686 |
| 2.060884780754915 | 2.611 | 1.913 | 1.691 |
| 2.064026373408505 | 2.614 | 1.916 | 1.696 |
| 2.067167966062094 | 2.616 | 1.92 | 1.701 |
| 2.070309558715684 | 2.619 | 1.923 | 1.706 |
| 2.073451151369273 | 2.622 | 1.927 | 1.711 |
| 2.076592744022863 | 2.624 | 1.93 | 1.716 |
| 2.079734336676452 | 2.627 | 1.934 | 1.721 |
| 2.082875929330042 | 2.63 | 1.937 | 1.726 |
| 2.086017521983632 | 2.632 | 1.941 | 1.731 |
| 2.089159114637221 | 2.635 | 1.944 | 1.737 |
| 2.092300707290811 | 2.637 | 1.948 | 1.742 |
| 2.095442299944401 | 2.64 | 1.951 | 1.747 |
| 2.09858389259799 | 2.643 | 1.955 | 1.752 |
| 2.10172548525158 | 2.645 | 1.958 | 1.758 |
| 2.104867077905169 | 2.648 | 1.962 | 1.763 |
| 2.108008670558759 | 2.651 | 1.965 | 1.768 |
| 2.111150263212349 | 2.653 | 1.969 | 1.774 |
| 2.114291855865938 | 2.656 | 1.972 | 1.779 |
| 2.117433448519528 | 2.658 | 1.976 | 1.784 |
| 2.120575041173117 | 2.661 | 1.979 | 1.79 |
| 2.123716633826707 | 2.664 | 1.983 | 1.795 |
| 2.126858226480297 | 2.666 | 1.986 | 1.8 |
| 2.129999819133886 | 2.669 | 1.99 | 1.806 |
| 2.133141411787476 | 2.671 | 1.993 | 1.811 |
| 2.136283004441065 | 2.674 | 1.997 | 1.817 |
| 2.139424597094655 | 2.676 | 2 | 1.822 |
| 2.142566189748245 | 2.679 | 2.004 | 1.828 |
| 2.145707782401834 | 2.682 | 2.007 | 1.833 |
| 2.148849375055424 | 2.684 | 2.011 | 1.839 |
| 2.151990967709013 | 2.687 | 2.014 | 1.845 |
| 2.155132560362603 | 2.689 | 2.018 | 1.85 |
| 2.158274153016193 | 2.692 | 2.021 | 1.856 |
| 2.161415745669782 | 2.695 | 2.025 | 1.862 |
| 2.164557338323372 | 2.697 | 2.029 | 1.867 |
| 2.167698930976961 | 2.7 | 2.032 | 1.873 |
| 2.170840523630551 | 2.702 | 2.036 | 1.879 |
| 2.173982116284141 | 2.705 | 2.039 | 1.884 |
| 2.17712370893773 | 2.707 | 2.043 | 1.89 |
| 2.18026530159132 | 2.71 | 2.046 | 1.896 |
| 2.183406894244909 | 2.712 | 2.05 | 1.902 |
| 2.186548486898499 | 2.715 | 2.053 | 1.908 |
| 2.189690079552089 | 2.718 | 2.057 | 1.913 |
| 2.192831672205678 | 2.72 | 2.06 | 1.919 |
| 2.195973264859268 | 2.723 | 2.064 | 1.925 |
| 2.199114857512857 | 2.725 | 2.068 | 1.931 |
| 2.202256450166447 | 2.728 | 2.071 | 1.937 |
| 2.205398042820036 | 2.73 | 2.075 | 1.943 |
| 2.208539635473626 | 2.733 | 2.078 | 1.949 |
| 2.211681228127216 | 2.735 | 2.082 | 1.955 |
| 2.214822820780805 | 2.738 | 2.085 | 1.961 |
| 2.217964413434395 | 2.74 | 2.089 | 1.967 |
| 2.221106006087984 | 2.743 | 2.093 | 1.973 |
| 2.224247598741574 | 2.745 | 2.096 | 1.979 |
| 2.227389191395164 | 2.748 | 2.1 | 1.985 |
| 2.230530784048753 | 2.751 | 2.103 | 1.992 |
| 2.233672376702343 | 2.753 | 2.107 | 1.998 |
| 2.236813969355933 | 2.756 | 2.11 | 2.004 |
| 2.239955562009522 | 2.758 | 2.114 | 2.01 |
| 2.243097154663112 | 2.761 | 2.118 | 2.016 |
| 2.246238747316701 | 2.763 | 2.121 | 2.023 |
| 2.249380339970291 | 2.766 | 2.125 | 2.029 |
| 2.252521932623881 | 2.768 | 2.128 | 2.035 |
| 2.25566352527747 | 2.771 | 2.132 | 2.042 |
| 2.25880511793106 | 2.773 | 2.136 | 2.048 |
| 2.261946710584649 | 2.776 | 2.139 | 2.054 |
| 2.265088303238239 | 2.778 | 2.143 | 2.061 |
| 2.268229895891829 | 2.781 | 2.146 | 2.067 |
| 2.271371488545418 | 2.783 | 2.15 | 2.074 |
| 2.274513081199008 | 2.786 | 2.154 | 2.08 |
| 2.277654673852597 | 2.788 | 2.157 | 2.087 |
| 2.280796266506186 | 2.791 | 2.161 | 2.093 |
| 2.283937859159776 | 2.793 | 2.164 | 2.1 |
| 2.287079451813366 | 2.796 | 2.168 | 2.107 |
| 2.290221044466955 | 2.798 | 2.172 | 2.113 |
| 2.293362637120545 | 2.801 | 2.175 | 2.12 |
| 2.296504229774135 | 2.803 | 2.179 | 2.126 |
| 2.299645822427724 | 2.806 | 2.183 | 2.133 |
| 2.302787415081314 | 2.808 | 2.186 | 2.14 |
| 2.305929007734904 | 2.811 | 2.19 | 2.147 |
| 2.309070600388493 | 2.813 | 2.193 | 2.153 |
| 2.312212193042083 | 2.815 | 2.197 | 2.16 |
| 2.315353785695672 | 2.818 | 2.201 | 2.167 |
| 2.318495378349262 | 2.82 | 2.204 | 2.174 |
| 2.321636971002852 | 2.823 | 2.208 | 2.181 |
| 2.324778563656441 | 2.825 | 2.212 | 2.188 |
| 2.327920156310031 | 2.828 | 2.215 | 2.195 |
| 2.33106174896362 | 2.83 | 2.219 | 2.202 |
| 2.33420334161721 | 2.833 | 2.222 | 2.209 |
| 2.3373449342708 | 2.835 | 2.226 | 2.216 |
| 2.340486526924389 | 2.838 | 2.23 | 2.223 |
| 2.343628119577979 | 2.84 | 2.233 | 2.23 |
| 2.346769712231568 | 2.843 | 2.237 | 2.237 |
| 2.349911304885158 | 2.845 | 2.241 | 2.244 |
| 2.353052897538748 | 2.847 | 2.244 | 2.252 |
| 2.356194490192337 | 2.85 | 2.248 | 2.259 |
| 2.359336082845927 | 2.852 | 2.252 | 2.266 |
| 2.362477675499516 | 2.855 | 2.255 | 2.273 |
| 2.365619268153106 | 2.857 | 2.259 | 2.281 |
| 2.368760860806696 | 2.86 | 2.263 | 2.288 |
| 2.371902453460285 | 2.862 | 2.266 | 2.295 |
| 2.375044046113875 | 2.865 | 2.27 | 2.303 |
| 2.378185638767464 | 2.867 | 2.274 | 2.31 |
| 2.381327231421054 | 2.869 | 2.277 | 2.318 |
| 2.384468824074644 | 2.872 | 2.281 | 2.325 |
| 2.387610416728233 | 2.874 | 2.285 | 2.333 |
| 2.390752009381823 | 2.877 | 2.288 | 2.34 |
| 2.393893602035412 | 2.879 | 2.292 | 2.348 |
| 2.397035194689002 | 2.882 | 2.296 | 2.355 |
| 2.400176787342591 | 2.884 | 2.299 | 2.363 |
| 2.403318379996181 | 2.886 | 2.303 | 2.371 |
| 2.406459972649771 | 2.889 | 2.307 | 2.378 |
| 2.40960156530336 | 2.891 | 2.311 | 2.386 |
| 2.41274315795695 | 2.894 | 2.314 | 2.394 |
| 2.41588475061054 | 2.896 | 2.318 | 2.402 |
| 2.419026343264129 | 2.899 | 2.322 | 2.41 |
| 2.422167935917719 | 2.901 | 2.325 | 2.417 |
| 2.425309528571308 | 2.903 | 2.329 | 2.425 |
| 2.428451121224898 | 2.906 | 2.333 | 2.433 |
| 2.431592713878488 | 2.908 | 2.336 | 2.441 |
| 2.434734306532077 | 2.911 | 2.34 | 2.449 |
| 2.437875899185667 | 2.913 | 2.344 | 2.457 |
| 2.441017491839256 | 2.915 | 2.348 | 2.465 |
| 2.444159084492846 | 2.918 | 2.351 | 2.473 |
| 2.447300677146435 | 2.92 | 2.355 | 2.482 |
| 2.450442269800025 | 2.923 | 2.359 | 2.49 |
| 2.453583862453615 | 2.925 | 2.362 | 2.498 |
| 2.456725455107204 | 2.927 | 2.366 | 2.506 |
| 2.459867047760794 | 2.93 | 2.37 | 2.514 |
| 2.463008640414384 | 2.932 | 2.374 | 2.523 |
| 2.466150233067973 | 2.935 | 2.377 | 2.531 |
| 2.469291825721563 | 2.937 | 2.381 | 2.54 |
| 2.472433418375152 | 2.939 | 2.385 | 2.548 |
| 2.475575011028742 | 2.942 | 2.388 | 2.556 |
| 2.478716603682332 | 2.944 | 2.392 | 2.565 |
| 2.481858196335921 | 2.947 | 2.396 | 2.573 |
| 2.48499978898951 | 2.949 | 2.4 | 2.582 |
| 2.4881413816431 | 2.951 | 2.403 | 2.591 |
| 2.49128297429669 | 2.954 | 2.407 | 2.599 |
| 2.49442456695028 | 2.956 | 2.411 | 2.608 |
| 2.497566159603869 | 2.959 | 2.415 | 2.617 |
| 2.500707752257458 | 2.961 | 2.418 | 2.625 |
| 2.503849344911048 | 2.963 | 2.422 | 2.634 |
| 2.506990937564638 | 2.966 | 2.426 | 2.643 |
| 2.510132530218228 | 2.968 | 2.43 | 2.652 |
| 2.513274122871817 | 2.97 | 2.433 | 2.661 |
| 2.516415715525407 | 2.973 | 2.437 | 2.67 |
| 2.519557308178996 | 2.975 | 2.441 | 2.678 |
| 2.522698900832586 | 2.978 | 2.445 | 2.687 |
| 2.525840493486176 | 2.98 | 2.448 | 2.697 |
| 2.528982086139765 | 2.982 | 2.452 | 2.706 |
| 2.532123678793355 | 2.985 | 2.456 | 2.715 |
| 2.535265271446944 | 2.987 | 2.46 | 2.724 |
| 2.538406864100534 | 2.989 | 2.463 | 2.733 |
| 2.541548456754124 | 2.992 | 2.467 | 2.742 |
| 2.544690049407713 | 2.994 | 2.471 | 2.752 |
| 2.547831642061302 | 2.996 | 2.475 | 2.761 |
| 2.550973234714892 | 2.999 | 2.478 | 2.77 |
| 2.554114827368482 | 3.001 | 2.482 | 2.78 |
| 2.557256420022072 | 3.004 | 2.486 | 2.789 |
| 2.560398012675661 | 3.006 | 2.49 | 2.798 |
| 2.563539605329251 | 3.008 | 2.493 | 2.808 |
| 2.56668119798284 | 3.011 | 2.497 | 2.817 |
| 2.56982279063643 | 3.013 | 2.501 | 2.827 |
| 2.57296438329002 | 3.015 | 2.505 | 2.837 |
| 2.576105975943609 | 3.018 | 2.509 | 2.846 |
| 2.579247568597199 | 3.02 | 2.512 | 2.856 |
| 2.582389161250788 | 3.022 | 2.516 | 2.866 |
| 2.585530753904377 | 3.025 | 2.52 | 2.876 |
| 2.588672346557967 | 3.027 | 2.524 | 2.885 |
| 2.591813939211557 | 3.029 | 2.527 | 2.895 |
| 2.594955531865147 | 3.032 | 2.531 | 2.905 |
| 2.598097124518736 | 3.034 | 2.535 | 2.915 |
| 2.601238717172326 | 3.036 | 2.539 | 2.925 |
| 2.604380309825915 | 3.039 | 2.543 | 2.935 |
| 2.607521902479505 | 3.041 | 2.546 | 2.945 |
| 2.610663495133095 | 3.043 | 2.55 | 2.955 |
| 2.613805087786684 | 3.046 | 2.554 | 2.965 |
| 2.616946680440274 | 3.048 | 2.558 | 2.976 |
| 2.620088273093863 | 3.05 | 2.562 | 2.986 |
| 2.623229865747452 | 3.053 | 2.565 | 2.996 |
| 2.626371458401042 | 3.055 | 2.569 | 3.006 |
| 2.629513051054632 | 3.057 | 2.573 | 3.017 |
| 2.632654643708222 | 3.06 | 2.577 | 3.027 |
| 2.635796236361811 | 3.062 | 2.581 | 3.038 |
| 2.638937829015401 | 3.064 | 2.584 | 3.048 |
| 2.642079421668991 | 3.067 | 2.588 | 3.059 |
| 2.64522101432258 | 3.069 | 2.592 | 3.069 |
| 2.64836260697617 | 3.071 | 2.596 | 3.08 |
| 2.651504199629759 | 3.074 | 2.6 | 3.091 |
| 2.654645792283349 | 3.076 | 2.604 | 3.101 |
| 2.657787384936938 | 3.078 | 2.607 | 3.112 |
| 2.660928977590528 | 3.081 | 2.611 | 3.123 |
| 2.664070570244118 | 3.083 | 2.615 | 3.134 |
| 2.667212162897707 | 3.085 | 2.619 | 3.144 |
| 2.670353755551297 | 3.088 | 2.623 | 3.155 |
| 2.673495348204887 | 3.09 | 2.626 | 3.166 |
| 2.676636940858476 | 3.092 | 2.63 | 3.177 |
| 2.679778533512066 | 3.095 | 2.634 | 3.188 |
| 2.682920126165655 | 3.097 | 2.638 | 3.199 |
| 2.686061718819245 | 3.099 | 2.642 | 3.211 |
| 2.689203311472835 | 3.101 | 2.646 | 3.222 |
| 2.692344904126424 | 3.104 | 2.649 | 3.233 |
| 2.695486496780014 | 3.106 | 2.653 | 3.244 |
| 2.698628089433603 | 3.108 | 2.657 | 3.256 |
| 2.701769682087193 | 3.111 | 2.661 | 3.267 |
| 2.704911274740782 | 3.113 | 2.665 | 3.278 |
| 2.708052867394372 | 3.115 | 2.669 | 3.29 |
| 2.711194460047962 | 3.118 | 2.672 | 3.301 |
| 2.714336052701551 | 3.12 | 2.676 | 3.313 |
| 2.717477645355141 | 3.122 | 2.68 | 3.324 |
| 2.720619238008731 | 3.125 | 2.684 | 3.336 |
| 2.72376083066232 | 3.127 | 2.688 | 3.348 |
| 2.72690242331591 | 3.129 | 2.692 | 3.359 |
| 2.730044015969499 | 3.131 | 2.695 | 3.371 |
| 2.733185608623089 | 3.134 | 2.699 | 3.383 |
| 2.736327201276678 | 3.136 | 2.703 | 3.395 |
| 2.739468793930268 | 3.138 | 2.707 | 3.407 |
| 2.742610386583858 | 3.141 | 2.711 | 3.419 |
| 2.745751979237447 | 3.143 | 2.715 | 3.431 |
| 2.748893571891036 | 3.145 | 2.719 | 3.443 |
| 2.752035164544627 | 3.147 | 2.722 | 3.455 |
| 2.755176757198216 | 3.15 | 2.726 | 3.467 |
| 2.758318349851806 | 3.152 | 2.73 | 3.479 |
| 2.761459942505395 | 3.154 | 2.734 | 3.491 |
| 2.764601535158985 | 3.157 | 2.738 | 3.503 |
| 2.767743127812574 | 3.159 | 2.742 | 3.516 |
| 2.770884720466164 | 3.161 | 2.746 | 3.528 |
| 2.774026313119754 | 3.164 | 2.749 | 3.54 |
| 2.777167905773343 | 3.166 | 2.753 | 3.553 |
| 2.780309498426932 | 3.168 | 2.757 | 3.565 |
| 2.783451091080522 | 3.17 | 2.761 | 3.578 |
| 2.786592683734112 | 3.173 | 2.765 | 3.59 |
| 2.789734276387701 | 3.175 | 2.769 | 3.603 |
| 2.792875869041291 | 3.177 | 2.773 | 3.616 |
| 2.796017461694881 | 3.18 | 2.777 | 3.628 |
| 2.79915905434847 | 3.182 | 2.78 | 3.641 |
| 2.80230064700206 | 3.184 | 2.784 | 3.654 |
| 2.80544223965565 | 3.186 | 2.788 | 3.667 |
| 2.808583832309239 | 3.189 | 2.792 | 3.679 |
| 2.811725424962829 | 3.191 | 2.796 | 3.692 |
| 2.814867017616419 | 3.193 | 2.8 | 3.705 |
| 2.818008610270008 | 3.195 | 2.804 | 3.718 |
| 2.821150202923598 | 3.198 | 2.808 | 3.731 |
| 2.824291795577187 | 3.2 | 2.811 | 3.744 |
| 2.827433388230777 | 3.202 | 2.815 | 3.757 |
| 2.830574980884366 | 3.205 | 2.819 | 3.771 |
| 2.833716573537956 | 3.207 | 2.823 | 3.784 |
| 2.836858166191546 | 3.209 | 2.827 | 3.797 |
| 2.839999758845135 | 3.211 | 2.831 | 3.81 |
| 2.843141351498725 | 3.214 | 2.835 | 3.824 |
| 2.846282944152314 | 3.216 | 2.839 | 3.837 |
| 2.849424536805904 | 3.218 | 2.842 | 3.85 |
| 2.852566129459494 | 3.22 | 2.846 | 3.864 |
| 2.855707722113083 | 3.223 | 2.85 | 3.877 |
| 2.858849314766673 | 3.225 | 2.854 | 3.891 |
| 2.861990907420262 | 3.227 | 2.858 | 3.904 |
| 2.865132500073852 | 3.23 | 2.862 | 3.918 |
| 2.868274092727442 | 3.232 | 2.866 | 3.932 |
| 2.871415685381031 | 3.234 | 2.87 | 3.945 |
| 2.874557278034621 | 3.236 | 2.874 | 3.959 |
| 2.87769887068821 | 3.239 | 2.877 | 3.973 |
| 2.8808404633418 | 3.241 | 2.881 | 3.987 |
| 2.88398205599539 | 3.243 | 2.885 | 4.001 |
| 2.88712364864898 | 3.245 | 2.889 | 4.015 |
| 2.890265241302569 | 3.248 | 2.893 | 4.028 |
| 2.893406833956158 | 3.25 | 2.897 | 4.042 |
| 2.896548426609748 | 3.252 | 2.901 | 4.056 |
| 2.899690019263338 | 3.254 | 2.905 | 4.07 |
| 2.902831611916927 | 3.257 | 2.909 | 4.085 |
| 2.905973204570517 | 3.259 | 2.913 | 4.099 |
| 2.909114797224106 | 3.261 | 2.916 | 4.113 |
| 2.912256389877696 | 3.264 | 2.92 | 4.127 |
| 2.915397982531286 | 3.266 | 2.924 | 4.141 |
| 2.918539575184875 | 3.268 | 2.928 | 4.156 |
| 2.921681167838465 | 3.27 | 2.932 | 4.17 |
| 2.924822760492054 | 3.273 | 2.936 | 4.184 |
| 2.927964353145644 | 3.275 | 2.94 | 4.199 |
| 2.931105945799234 | 3.277 | 2.944 | 4.213 |
| 2.934247538452823 | 3.279 | 2.948 | 4.227 |
| 2.937389131106413 | 3.282 | 2.952 | 4.242 |
| 2.940530723760002 | 3.284 | 2.955 | 4.256 |
| 2.943672316413592 | 3.286 | 2.959 | 4.271 |
| 2.946813909067182 | 3.288 | 2.963 | 4.286 |
| 2.949955501720771 | 3.291 | 2.967 | 4.3 |
| 2.953097094374361 | 3.293 | 2.971 | 4.315 |
| 2.95623868702795 | 3.295 | 2.975 | 4.33 |
| 2.95938027968154 | 3.297 | 2.979 | 4.344 |
| 2.96252187233513 | 3.3 | 2.983 | 4.359 |
| 2.965663464988719 | 3.302 | 2.987 | 4.374 |
| 2.968805057642309 | 3.304 | 2.991 | 4.389 |
| 2.971946650295898 | 3.306 | 2.995 | 4.403 |
| 2.975088242949488 | 3.309 | 2.998 | 4.418 |
| 2.978229835603078 | 3.311 | 3.002 | 4.433 |
| 2.981371428256667 | 3.313 | 3.006 | 4.448 |
| 2.984513020910257 | 3.315 | 3.01 | 4.463 |
| 2.987654613563846 | 3.318 | 3.014 | 4.478 |
| 2.990796206217436 | 3.32 | 3.018 | 4.493 |
| 2.993937798871025 | 3.322 | 3.022 | 4.508 |
| 2.997079391524615 | 3.324 | 3.026 | 4.523 |
| 3.000220984178205 | 3.327 | 3.03 | 4.538 |
| 3.003362576831794 | 3.329 | 3.034 | 4.553 |
| 3.006504169485384 | 3.331 | 3.038 | 4.569 |
| 3.009645762138974 | 3.333 | 3.042 | 4.584 |
| 3.012787354792563 | 3.336 | 3.045 | 4.599 |
| 3.015928947446153 | 3.338 | 3.049 | 4.614 |
| 3.019070540099742 | 3.34 | 3.053 | 4.629 |
| 3.022212132753332 | 3.342 | 3.057 | 4.645 |
| 3.025353725406922 | 3.345 | 3.061 | 4.66 |
| 3.028495318060511 | 3.347 | 3.065 | 4.675 |
| 3.031636910714101 | 3.349 | 3.069 | 4.691 |
| 3.03477850336769 | 3.351 | 3.073 | 4.706 |
| 3.03792009602128 | 3.354 | 3.077 | 4.721 |
| 3.04106168867487 | 3.356 | 3.081 | 4.737 |
| 3.04420328132846 | 3.358 | 3.085 | 4.752 |
| 3.047344873982049 | 3.36 | 3.089 | 4.768 |
| 3.050486466635638 | 3.363 | 3.093 | 4.783 |
| 3.053628059289228 | 3.365 | 3.096 | 4.798 |
| 3.056769651942818 | 3.367 | 3.1 | 4.814 |
| 3.059911244596407 | 3.369 | 3.104 | 4.829 |
| 3.063052837249997 | 3.372 | 3.108 | 4.845 |
| 3.066194429903586 | 3.374 | 3.112 | 4.86 |
| 3.069336022557176 | 3.376 | 3.116 | 4.876 |
| 3.072477615210766 | 3.378 | 3.12 | 4.892 |
| 3.075619207864355 | 3.381 | 3.124 | 4.907 |
| 3.078760800517945 | 3.383 | 3.128 | 4.923 |
| 3.081902393171534 | 3.385 | 3.132 | 4.938 |
| 3.085043985825124 | 3.387 | 3.136 | 4.954 |
| 3.088185578478713 | 3.39 | 3.14 | 4.969 |
| 3.091327171132303 | 3.392 | 3.144 | 4.985 |
| 3.094468763785893 | 3.394 | 3.147 | 5.001 |
| 3.097610356439482 | 3.396 | 3.151 | 5.016 |
| 3.100751949093072 | 3.399 | 3.155 | 5.032 |
| 3.103893541746661 | 3.401 | 3.159 | 5.048 |
| 3.107035134400251 | 3.403 | 3.163 | 5.063 |
| 3.110176727053841 | 3.405 | 3.167 | 5.079 |
| 3.11331831970743 | 3.408 | 3.171 | 5.095 |
| 3.11645991236102 | 3.41 | 3.175 | 5.11 |
| 3.11960150501461 | 3.412 | 3.179 | 5.126 |
| 3.122743097668199 | 3.414 | 3.183 | 5.142 |
| 3.125884690321789 | 3.417 | 3.187 | 5.157 |
| 3.129026282975378 | 3.419 | 3.191 | 5.173 |
| 3.132167875628968 | 3.421 | 3.195 | 5.189 |
| 3.135309468282557 | 3.423 | 3.199 | 5.205 |
| 3.138451060936147 | 3.426 | 3.202 | 5.22 |
| 3.141592653589737 | 3.428 | 3.206 | 5.236 |
| 3.144734246243326 | 3.43 | 3.21 | 5.252 |
| 3.147875838896916 | 3.432 | 3.214 | 5.267 |
| 3.151017431550505 | 3.434 | 3.218 | 5.283 |
| 3.154159024204095 | 3.437 | 3.222 | 5.299 |
| 3.157300616857685 | 3.439 | 3.226 | 5.315 |
| 3.160442209511274 | 3.441 | 3.23 | 5.33 |
| 3.163583802164864 | 3.443 | 3.234 | 5.346 |
| 3.166725394818453 | 3.446 | 3.238 | 5.362 |
| 3.169866987472043 | 3.448 | 3.242 | 5.377 |
| 3.173008580125633 | 3.45 | 3.246 | 5.393 |
| 3.176150172779222 | 3.452 | 3.25 | 5.409 |
| 3.179291765432812 | 3.455 | 3.253 | 5.424 |
| 3.182433358086401 | 3.457 | 3.257 | 5.44 |
| 3.185574950739991 | 3.459 | 3.261 | 5.456 |
| 3.188716543393581 | 3.461 | 3.265 | 5.471 |
| 3.19185813604717 | 3.464 | 3.269 | 5.487 |
| 3.19499972870076 | 3.466 | 3.273 | 5.503 |
| 3.198141321354349 | 3.468 | 3.277 | 5.518 |
| 3.20128291400794 | 3.47 | 3.281 | 5.534 |
| 3.204424506661528 | 3.473 | 3.285 | 5.549 |
| 3.207566099315118 | 3.475 | 3.289 | 5.565 |
| 3.210707691968708 | 3.477 | 3.293 | 5.58 |
| 3.213849284622297 | 3.479 | 3.297 | 5.596 |
| 3.216990877275887 | 3.482 | 3.301 | 5.612 |
| 3.220132469929476 | 3.484 | 3.305 | 5.627 |
| 3.223274062583066 | 3.486 | 3.308 | 5.643 |
| 3.226415655236656 | 3.488 | 3.312 | 5.658 |
| 3.229557247890245 | 3.491 | 3.316 | 5.674 |
| 3.232698840543835 | 3.493 | 3.32 | 5.689 |
| 3.235840433197425 | 3.495 | 3.324 | 5.704 |
| 3.238982025851014 | 3.497 | 3.328 | 5.72 |
| 3.242123618504604 | 3.5 | 3.332 | 5.735 |
| 3.245265211158193 | 3.502 | 3.336 | 5.751 |
| 3.248406803811783 | 3.504 | 3.34 | 5.766 |
| 3.251548396465373 | 3.506 | 3.344 | 5.781 |
| 3.254689989118962 | 3.509 | 3.348 | 5.797 |
| 3.257831581772551 | 3.511 | 3.352 | 5.812 |
| 3.260973174426141 | 3.513 | 3.356 | 5.827 |
| 3.26411476707973 | 3.515 | 3.359 | 5.843 |
| 3.267256359733321 | 3.518 | 3.363 | 5.858 |
| 3.27039795238691 | 3.52 | 3.367 | 5.873 |
| 3.2735395450405 | 3.522 | 3.371 | 5.888 |
| 3.276681137694089 | 3.524 | 3.375 | 5.903 |
| 3.279822730347679 | 3.527 | 3.379 | 5.919 |
| 3.282964323001269 | 3.529 | 3.383 | 5.934 |
| 3.286105915654858 | 3.531 | 3.387 | 5.949 |
| 3.289247508308448 | 3.533 | 3.391 | 5.964 |
| 3.292389100962037 | 3.536 | 3.395 | 5.979 |
| 3.295530693615627 | 3.538 | 3.399 | 5.994 |
| 3.298672286269217 | 3.54 | 3.403 | 6.009 |
| 3.301813878922806 | 3.542 | 3.406 | 6.024 |
| 3.304955471576396 | 3.545 | 3.41 | 6.039 |
| 3.308097064229985 | 3.547 | 3.414 | 6.054 |
| 3.311238656883575 | 3.549 | 3.418 | 6.069 |
| 3.314380249537165 | 3.551 | 3.422 | 6.083 |
| 3.317521842190754 | 3.554 | 3.426 | 6.098 |
| 3.320663434844344 | 3.556 | 3.43 | 6.113 |
| 3.323805027497933 | 3.558 | 3.434 | 6.128 |
| 3.326946620151523 | 3.56 | 3.438 | 6.142 |
| 3.330088212805113 | 3.563 | 3.442 | 6.157 |
| 3.333229805458702 | 3.565 | 3.446 | 6.172 |
| 3.336371398112292 | 3.567 | 3.449 | 6.186 |
| 3.339512990765881 | 3.569 | 3.453 | 6.201 |
| 3.342654583419471 | 3.572 | 3.457 | 6.215 |
| 3.345796176073061 | 3.574 | 3.461 | 6.23 |
| 3.34893776872665 | 3.576 | 3.465 | 6.245 |
| 3.35207936138024 | 3.578 | 3.469 | 6.259 |
| 3.355220954033829 | 3.581 | 3.473 | 6.273 |
| 3.358362546687419 | 3.583 | 3.477 | 6.288 |
| 3.361504139341009 | 3.585 | 3.481 | 6.302 |
| 3.364645731994598 | 3.587 | 3.485 | 6.316 |
| 3.367787324648188 | 3.59 | 3.489 | 6.331 |
| 3.370928917301777 | 3.592 | 3.492 | 6.345 |
| 3.374070509955367 | 3.594 | 3.496 | 6.359 |
| 3.377212102608956 | 3.597 | 3.5 | 6.373 |
| 3.380353695262546 | 3.599 | 3.504 | 6.387 |
| 3.383495287916136 | 3.601 | 3.508 | 6.401 |
| 3.386636880569725 | 3.603 | 3.512 | 6.416 |
| 3.389778473223315 | 3.606 | 3.516 | 6.43 |
| 3.392920065876904 | 3.608 | 3.52 | 6.444 |
| 3.396061658530494 | 3.61 | 3.524 | 6.457 |
| 3.399203251184084 | 3.612 | 3.528 | 6.471 |
| 3.402344843837673 | 3.615 | 3.531 | 6.485 |
| 3.405486436491263 | 3.617 | 3.535 | 6.499 |
| 3.408628029144852 | 3.619 | 3.539 | 6.513 |
| 3.411769621798442 | 3.621 | 3.543 | 6.527 |
| 3.414911214452032 | 3.624 | 3.547 | 6.54 |
| 3.418052807105621 | 3.626 | 3.551 | 6.554 |
| 3.421194399759211 | 3.628 | 3.555 | 6.568 |
| 3.4243359924128 | 3.63 | 3.559 | 6.581 |
| 3.42747758506639 | 3.633 | 3.563 | 6.595 |
| 3.43061917771998 | 3.635 | 3.566 | 6.608 |
| 3.433760770373569 | 3.637 | 3.57 | 6.622 |
| 3.436902363027159 | 3.64 | 3.574 | 6.635 |
| 3.440043955680748 | 3.642 | 3.578 | 6.648 |
| 3.443185548334338 | 3.644 | 3.582 | 6.662 |
| 3.446327140987927 | 3.646 | 3.586 | 6.675 |
| 3.449468733641517 | 3.649 | 3.59 | 6.688 |
| 3.452610326295107 | 3.651 | 3.594 | 6.701 |
| 3.455751918948696 | 3.653 | 3.597 | 6.715 |
| 3.458893511602286 | 3.655 | 3.601 | 6.728 |
| 3.462035104255876 | 3.658 | 3.605 | 6.741 |
| 3.465176696909465 | 3.66 | 3.609 | 6.754 |
| 3.468318289563055 | 3.662 | 3.613 | 6.767 |
| 3.471459882216644 | 3.665 | 3.617 | 6.78 |
| 3.474601474870234 | 3.667 | 3.621 | 6.793 |
| 3.477743067523824 | 3.669 | 3.625 | 6.805 |
| 3.480884660177413 | 3.671 | 3.628 | 6.818 |
| 3.484026252831002 | 3.674 | 3.632 | 6.831 |
| 3.487167845484592 | 3.676 | 3.636 | 6.844 |
| 3.490309438138182 | 3.678 | 3.64 | 6.856 |
| 3.493451030791772 | 3.681 | 3.644 | 6.869 |
| 3.496592623445361 | 3.683 | 3.648 | 6.882 |
| 3.499734216098951 | 3.685 | 3.652 | 6.894 |
| 3.50287580875254 | 3.687 | 3.656 | 6.907 |
| 3.50601740140613 | 3.69 | 3.659 | 6.919 |
| 3.50915899405972 | 3.692 | 3.663 | 6.932 |
| 3.512300586713309 | 3.694 | 3.667 | 6.944 |
| 3.515442179366899 | 3.697 | 3.671 | 6.956 |
| 3.518583772020488 | 3.699 | 3.675 | 6.969 |
| 3.521725364674078 | 3.701 | 3.679 | 6.981 |
| 3.524866957327668 | 3.703 | 3.683 | 6.993 |
| 3.528008549981257 | 3.706 | 3.686 | 7.005 |
| 3.531150142634847 | 3.708 | 3.69 | 7.017 |
| 3.534291735288436 | 3.71 | 3.694 | 7.029 |
| 3.537433327942026 | 3.713 | 3.698 | 7.041 |
| 3.540574920595616 | 3.715 | 3.702 | 7.053 |
| 3.543716513249205 | 3.717 | 3.706 | 7.065 |
| 3.546858105902795 | 3.72 | 3.71 | 7.077 |
| 3.549999698556384 | 3.722 | 3.713 | 7.089 |
| 3.553141291209974 | 3.724 | 3.717 | 7.101 |
| 3.556282883863564 | 3.726 | 3.721 | 7.113 |
| 3.559424476517153 | 3.729 | 3.725 | 7.124 |
| 3.562566069170743 | 3.731 | 3.729 | 7.136 |
| 3.565707661824332 | 3.733 | 3.733 | 7.148 |
| 3.568849254477922 | 3.736 | 3.736 | 7.159 |
| 3.571990847131511 | 3.738 | 3.74 | 7.171 |
| 3.575132439785101 | 3.74 | 3.744 | 7.182 |
| 3.578274032438691 | 3.743 | 3.748 | 7.194 |
| 3.58141562509228 | 3.745 | 3.752 | 7.205 |
| 3.58455721774587 | 3.747 | 3.756 | 7.216 |
| 3.58769881039946 | 3.749 | 3.759 | 7.228 |
| 3.590840403053049 | 3.752 | 3.763 | 7.239 |
| 3.593981995706639 | 3.754 | 3.767 | 7.25 |
| 3.597123588360228 | 3.756 | 3.771 | 7.261 |
| 3.600265181013818 | 3.759 | 3.775 | 7.272 |
| 3.603406773667407 | 3.761 | 3.779 | 7.284 |
| 3.606548366320997 | 3.763 | 3.782 | 7.295 |
| 3.609689958974587 | 3.766 | 3.786 | 7.306 |
| 3.612831551628176 | 3.768 | 3.79 | 7.317 |
| 3.615973144281766 | 3.77 | 3.794 | 7.328 |
| 3.619114736935355 | 3.773 | 3.798 | 7.338 |
| 3.622256329588945 | 3.775 | 3.802 | 7.349 |
| 3.625397922242534 | 3.777 | 3.805 | 7.36 |
| 3.628539514896124 | 3.78 | 3.809 | 7.371 |
| 3.631681107549714 | 3.782 | 3.813 | 7.381 |
| 3.634822700203303 | 3.784 | 3.817 | 7.392 |
| 3.637964292856893 | 3.787 | 3.821 | 7.403 |
| 3.641105885510483 | 3.789 | 3.824 | 7.413 |
| 3.644247478164072 | 3.791 | 3.828 | 7.424 |
| 3.647389070817662 | 3.793 | 3.832 | 7.434 |
| 3.650530663471251 | 3.796 | 3.836 | 7.445 |
| 3.653672256124841 | 3.798 | 3.84 | 7.455 |
| 3.656813848778431 | 3.8 | 3.844 | 7.466 |
| 3.65995544143202 | 3.803 | 3.847 | 7.476 |
| 3.66309703408561 | 3.805 | 3.851 | 7.486 |
| 3.666238626739199 | 3.807 | 3.855 | 7.496 |
| 3.66938021939279 | 3.81 | 3.859 | 7.507 |
| 3.672521812046378 | 3.812 | 3.863 | 7.517 |
| 3.675663404699968 | 3.814 | 3.866 | 7.527 |
| 3.678804997353558 | 3.817 | 3.87 | 7.537 |
| 3.681946590007147 | 3.819 | 3.874 | 7.547 |
| 3.685088182660737 | 3.821 | 3.878 | 7.557 |
| 3.688229775314326 | 3.824 | 3.881 | 7.567 |
| 3.691371367967916 | 3.826 | 3.885 | 7.577 |
| 3.694512960621506 | 3.829 | 3.889 | 7.587 |
| 3.697654553275095 | 3.831 | 3.893 | 7.596 |
| 3.700796145928685 | 3.833 | 3.897 | 7.606 |
| 3.703937738582274 | 3.836 | 3.9 | 7.616 |
| 3.707079331235864 | 3.838 | 3.904 | 7.626 |
| 3.710220923889454 | 3.84 | 3.908 | 7.635 |
| 3.713362516543043 | 3.843 | 3.912 | 7.645 |
| 3.716504109196633 | 3.845 | 3.916 | 7.654 |
| 3.719645701850223 | 3.847 | 3.919 | 7.664 |
| 3.722787294503812 | 3.85 | 3.923 | 7.674 |
| 3.725928887157402 | 3.852 | 3.927 | 7.683 |
| 3.729070479810991 | 3.854 | 3.931 | 7.692 |
| 3.732212072464581 | 3.857 | 3.934 | 7.702 |
| 3.735353665118171 | 3.859 | 3.938 | 7.711 |
| 3.73849525777176 | 3.861 | 3.942 | 7.72 |
| 3.74163685042535 | 3.864 | 3.946 | 7.73 |
| 3.744778443078939 | 3.866 | 3.949 | 7.739 |
| 3.747920035732529 | 3.869 | 3.953 | 7.748 |
| 3.751061628386119 | 3.871 | 3.957 | 7.757 |
| 3.754203221039708 | 3.873 | 3.961 | 7.766 |
| 3.757344813693298 | 3.876 | 3.964 | 7.775 |
| 3.760486406346887 | 3.878 | 3.968 | 7.784 |
| 3.763627999000477 | 3.88 | 3.972 | 7.793 |
| 3.766769591654067 | 3.883 | 3.976 | 7.802 |
| 3.769911184307656 | 3.885 | 3.979 | 7.811 |
| 3.773052776961246 | 3.887 | 3.983 | 7.82 |
| 3.776194369614835 | 3.89 | 3.987 | 7.829 |
| 3.779335962268425 | 3.892 | 3.991 | 7.838 |
| 3.782477554922014 | 3.895 | 3.994 | 7.847 |
| 3.785619147575604 | 3.897 | 3.998 | 7.855 |
| 3.788760740229193 | 3.899 | 4.002 | 7.864 |
| 3.791902332882783 | 3.902 | 4.006 | 7.873 |
| 3.795043925536373 | 3.904 | 4.009 | 7.881 |
| 3.798185518189962 | 3.907 | 4.013 | 7.89 |
| 3.801327110843552 | 3.909 | 4.017 | 7.899 |
| 3.804468703497142 | 3.911 | 4.021 | 7.907 |
| 3.807610296150731 | 3.914 | 4.024 | 7.916 |
| 3.810751888804321 | 3.916 | 4.028 | 7.924 |
| 3.813893481457911 | 3.918 | 4.032 | 7.932 |
| 3.8170350741115 | 3.921 | 4.035 | 7.941 |
| 3.82017666676509 | 3.923 | 4.039 | 7.949 |
| 3.823318259418679 | 3.926 | 4.043 | 7.958 |
| 3.826459852072269 | 3.928 | 4.047 | 7.966 |
| 3.829601444725859 | 3.93 | 4.05 | 7.974 |
| 3.832743037379448 | 3.933 | 4.054 | 7.982 |
| 3.835884630033038 | 3.935 | 4.058 | 7.99 |
| 3.839026222686627 | 3.938 | 4.062 | 7.999 |
| 3.842167815340217 | 3.94 | 4.065 | 8.007 |
| 3.845309407993807 | 3.942 | 4.069 | 8.015 |
| 3.848451000647396 | 3.945 | 4.073 | 8.023 |
| 3.851592593300986 | 3.947 | 4.076 | 8.031 |
| 3.854734185954575 | 3.95 | 4.08 | 8.039 |
| 3.857875778608165 | 3.952 | 4.084 | 8.047 |
| 3.861017371261755 | 3.955 | 4.087 | 8.055 |
| 3.864158963915344 | 3.957 | 4.091 | 8.062 |
| 3.867300556568933 | 3.959 | 4.095 | 8.07 |
| 3.870442149222523 | 3.962 | 4.099 | 8.078 |
| 3.873583741876112 | 3.964 | 4.102 | 8.086 |
| 3.876725334529703 | 3.967 | 4.106 | 8.094 |
| 3.879866927183292 | 3.969 | 4.11 | 8.101 |
| 3.883008519836882 | 3.971 | 4.113 | 8.109 |
| 3.886150112490471 | 3.974 | 4.117 | 8.117 |
| 3.889291705144061 | 3.976 | 4.121 | 8.124 |
| 3.892433297797651 | 3.979 | 4.124 | 8.132 |
| 3.89557489045124 | 3.981 | 4.128 | 8.139 |
| 3.89871648310483 | 3.984 | 4.132 | 8.147 |
| 3.901858075758419 | 3.986 | 4.135 | 8.154 |
| 3.904999668412009 | 3.988 | 4.139 | 8.162 |
| 3.908141261065598 | 3.991 | 4.143 | 8.169 |
| 3.911282853719188 | 3.993 | 4.146 | 8.177 |
| 3.914424446372778 | 3.996 | 4.15 | 8.184 |
| 3.917566039026367 | 3.998 | 4.154 | 8.191 |
| 3.920707631679957 | 4.001 | 4.157 | 8.199 |
| 3.923849224333547 | 4.003 | 4.161 | 8.206 |
| 3.926990816987136 | 4.006 | 4.165 | 8.213 |
| 3.930132409640726 | 4.008 | 4.168 | 8.22 |
| 3.933274002294315 | 4.01 | 4.172 | 8.228 |
| 3.936415594947905 | 4.013 | 4.176 | 8.235 |
| 3.939557187601495 | 4.015 | 4.179 | 8.242 |
| 3.942698780255084 | 4.018 | 4.183 | 8.249 |
| 3.945840372908674 | 4.02 | 4.187 | 8.256 |
| 3.948981965562263 | 4.023 | 4.19 | 8.263 |
| 3.952123558215853 | 4.025 | 4.194 | 8.27 |
| 3.955265150869442 | 4.028 | 4.198 | 8.277 |
| 3.958406743523032 | 4.03 | 4.201 | 8.284 |
| 3.961548336176622 | 4.033 | 4.205 | 8.291 |
| 3.964689928830211 | 4.035 | 4.208 | 8.298 |
| 3.967831521483801 | 4.038 | 4.212 | 8.305 |
| 3.97097311413739 | 4.04 | 4.216 | 8.312 |
| 3.97411470679098 | 4.043 | 4.219 | 8.318 |
| 3.97725629944457 | 4.045 | 4.223 | 8.325 |
| 3.98039789209816 | 4.047 | 4.227 | 8.332 |
| 3.983539484751749 | 4.05 | 4.23 | 8.339 |
| 3.986681077405338 | 4.052 | 4.234 | 8.345 |
| 3.989822670058928 | 4.055 | 4.237 | 8.352 |
| 3.992964262712517 | 4.057 | 4.241 | 8.359 |
| 3.996105855366107 | 4.06 | 4.245 | 8.365 |
| 3.999247448019697 | 4.062 | 4.248 | 8.372 |
| 4.002389040673287 | 4.065 | 4.252 | 8.379 |
| 4.005530633326877 | 4.067 | 4.256 | 8.385 |
| 4.008672225980466 | 4.07 | 4.259 | 8.392 |
| 4.011813818634056 | 4.072 | 4.263 | 8.398 |
| 4.014955411287645 | 4.075 | 4.266 | 8.405 |
| 4.018097003941234 | 4.077 | 4.27 | 8.411 |
| 4.021238596594824 | 4.08 | 4.274 | 8.418 |
| 4.024380189248414 | 4.082 | 4.277 | 8.424 |
| 4.027521781902004 | 4.085 | 4.281 | 8.43 |
| 4.030663374555593 | 4.087 | 4.284 | 8.437 |
| 4.033804967209183 | 4.09 | 4.288 | 8.443 |
| 4.036946559862773 | 4.092 | 4.292 | 8.449 |
| 4.040088152516362 | 4.095 | 4.295 | 8.456 |
| 4.043229745169951 | 4.097 | 4.299 | 8.462 |
| 4.046371337823541 | 4.1 | 4.302 | 8.468 |
| 4.049512930477131 | 4.102 | 4.306 | 8.474 |
| 4.05265452313072 | 4.105 | 4.309 | 8.48 |
| 4.05579611578431 | 4.108 | 4.313 | 8.487 |
| 4.0589377084379 | 4.11 | 4.317 | 8.493 |
| 4.062079301091489 | 4.113 | 4.32 | 8.499 |
| 4.065220893745079 | 4.115 | 4.324 | 8.505 |
| 4.068362486398668 | 4.118 | 4.327 | 8.511 |
| 4.071504079052258 | 4.12 | 4.331 | 8.517 |
| 4.074645671705848 | 4.123 | 4.335 | 8.523 |
| 4.077787264359437 | 4.125 | 4.338 | 8.529 |
| 4.080928857013027 | 4.128 | 4.342 | 8.535 |
| 4.084070449666616 | 4.13 | 4.345 | 8.541 |
| 4.087212042320206 | 4.133 | 4.349 | 8.547 |
| 4.090353634973795 | 4.135 | 4.352 | 8.553 |
| 4.093495227627385 | 4.138 | 4.356 | 8.559 |
| 4.096636820280975 | 4.141 | 4.359 | 8.564 |
| 4.099778412934564 | 4.143 | 4.363 | 8.57 |
| 4.102920005588154 | 4.146 | 4.367 | 8.576 |
| 4.106061598241744 | 4.148 | 4.37 | 8.582 |
| 4.109203190895333 | 4.151 | 4.374 | 8.588 |
| 4.112344783548923 | 4.153 | 4.377 | 8.593 |
| 4.115486376202512 | 4.156 | 4.381 | 8.599 |
| 4.118627968856102 | 4.158 | 4.384 | 8.605 |
| 4.121769561509692 | 4.161 | 4.388 | 8.61 |
| 4.124911154163281 | 4.164 | 4.391 | 8.616 |
| 4.128052746816871 | 4.166 | 4.395 | 8.622 |
| 4.13119433947046 | 4.169 | 4.398 | 8.627 |
| 4.13433593212405 | 4.171 | 4.402 | 8.633 |
| 4.13747752477764 | 4.174 | 4.405 | 8.639 |
| 4.14061911743123 | 4.176 | 4.409 | 8.644 |
| 4.143760710084818 | 4.179 | 4.412 | 8.65 |
| 4.146902302738408 | 4.182 | 4.416 | 8.655 |
| 4.150043895391998 | 4.184 | 4.42 | 8.661 |
| 4.153185488045588 | 4.187 | 4.423 | 8.666 |
| 4.156327080699177 | 4.189 | 4.427 | 8.672 |
| 4.159468673352766 | 4.192 | 4.43 | 8.677 |
| 4.162610266006356 | 4.195 | 4.434 | 8.682 |
| 4.165751858659946 | 4.197 | 4.437 | 8.688 |
| 4.168893451313535 | 4.2 | 4.441 | 8.693 |
| 4.172035043967125 | 4.202 | 4.444 | 8.698 |
| 4.175176636620715 | 4.205 | 4.448 | 8.704 |
| 4.178318229274304 | 4.208 | 4.451 | 8.709 |
| 4.181459821927894 | 4.21 | 4.455 | 8.714 |
| 4.184601414581484 | 4.213 | 4.458 | 8.72 |
| 4.187743007235073 | 4.215 | 4.462 | 8.725 |
| 4.190884599888663 | 4.218 | 4.465 | 8.73 |
| 4.194026192542252 | 4.221 | 4.469 | 8.735 |
| 4.197167785195842 | 4.223 | 4.472 | 8.741 |
| 4.200309377849432 | 4.226 | 4.476 | 8.746 |
| 4.203450970503021 | 4.229 | 4.479 | 8.751 |
| 4.206592563156611 | 4.231 | 4.482 | 8.756 |
| 4.2097341558102 | 4.234 | 4.486 | 8.761 |
| 4.21287574846379 | 4.236 | 4.489 | 8.766 |
| 4.21601734111738 | 4.239 | 4.493 | 8.771 |
| 4.21915893377097 | 4.242 | 4.496 | 8.776 |
| 4.222300526424559 | 4.244 | 4.5 | 8.781 |
| 4.225442119078148 | 4.247 | 4.503 | 8.786 |
| 4.228583711731738 | 4.25 | 4.507 | 8.791 |
| 4.231725304385327 | 4.252 | 4.51 | 8.796 |
| 4.234866897038917 | 4.255 | 4.514 | 8.801 |
| 4.238008489692506 | 4.258 | 4.517 | 8.806 |
| 4.241150082346096 | 4.26 | 4.521 | 8.811 |
| 4.244291674999685 | 4.263 | 4.524 | 8.816 |
| 4.247433267653276 | 4.266 | 4.528 | 8.821 |
| 4.250574860306865 | 4.268 | 4.531 | 8.826 |
| 4.253716452960455 | 4.271 | 4.534 | 8.831 |
| 4.256858045614044 | 4.274 | 4.538 | 8.836 |
| 4.259999638267634 | 4.276 | 4.541 | 8.841 |
| 4.263141230921224 | 4.279 | 4.545 | 8.845 |
| 4.266282823574813 | 4.282 | 4.548 | 8.85 |
| 4.269424416228403 | 4.284 | 4.552 | 8.855 |
| 4.272566008881992 | 4.287 | 4.555 | 8.86 |
| 4.275707601535582 | 4.29 | 4.558 | 8.865 |
| 4.27884919418917 | 4.292 | 4.562 | 8.869 |
| 4.28199078684276 | 4.295 | 4.565 | 8.874 |
| 4.285132379496351 | 4.298 | 4.569 | 8.879 |
| 4.28827397214994 | 4.3 | 4.572 | 8.883 |
| 4.29141556480353 | 4.303 | 4.576 | 8.888 |
| 4.294557157457119 | 4.306 | 4.579 | 8.893 |
| 4.29769875011071 | 4.309 | 4.582 | 8.897 |
| 4.300840342764299 | 4.311 | 4.586 | 8.902 |
| 4.303981935417888 | 4.314 | 4.589 | 8.907 |
| 4.307123528071478 | 4.317 | 4.593 | 8.911 |
| 4.310265120725067 | 4.319 | 4.596 | 8.916 |
| 4.313406713378657 | 4.322 | 4.6 | 8.92 |
| 4.316548306032247 | 4.325 | 4.603 | 8.925 |
| 4.319689898685836 | 4.328 | 4.606 | 8.93 |
| 4.322831491339426 | 4.33 | 4.61 | 8.934 |
| 4.325973083993015 | 4.333 | 4.613 | 8.939 |
| 4.329114676646605 | 4.336 | 4.617 | 8.943 |
| 4.332256269300195 | 4.338 | 4.62 | 8.947 |
| 4.335397861953784 | 4.341 | 4.623 | 8.952 |
| 4.338539454607374 | 4.344 | 4.627 | 8.956 |
| 4.341681047260963 | 4.347 | 4.63 | 8.961 |
| 4.344822639914553 | 4.349 | 4.633 | 8.965 |
| 4.347964232568143 | 4.352 | 4.637 | 8.97 |
| 4.351105825221732 | 4.355 | 4.64 | 8.974 |
| 4.354247417875322 | 4.358 | 4.644 | 8.978 |
| 4.357389010528911 | 4.36 | 4.647 | 8.983 |
| 4.360530603182501 | 4.363 | 4.65 | 8.987 |
| 4.36367219583609 | 4.366 | 4.654 | 8.991 |
| 4.36681378848968 | 4.369 | 4.657 | 8.996 |
| 4.36995538114327 | 4.372 | 4.66 | 9 |
| 4.373096973796859 | 4.374 | 4.664 | 9.004 |
| 4.376238566450449 | 4.377 | 4.667 | 9.009 |
| 4.379380159104038 | 4.38 | 4.671 | 9.013 |
| 4.382521751757628 | 4.383 | 4.674 | 9.017 |
| 4.385663344411217 | 4.385 | 4.677 | 9.021 |
| 4.388804937064807 | 4.388 | 4.681 | 9.026 |
| 4.391946529718397 | 4.391 | 4.684 | 9.03 |
| 4.395088122371987 | 4.394 | 4.687 | 9.034 |
| 4.398229715025576 | 4.397 | 4.691 | 9.038 |
| 4.401371307679165 | 4.399 | 4.694 | 9.042 |
| 4.404512900332755 | 4.402 | 4.697 | 9.046 |
| 4.407654492986345 | 4.405 | 4.701 | 9.051 |
| 4.410796085639934 | 4.408 | 4.704 | 9.055 |
| 4.413937678293524 | 4.411 | 4.707 | 9.059 |
| 4.417079270947114 | 4.413 | 4.711 | 9.063 |
| 4.420220863600703 | 4.416 | 4.714 | 9.067 |
| 4.423362456254293 | 4.419 | 4.717 | 9.071 |
| 4.426504048907883 | 4.422 | 4.721 | 9.075 |
| 4.429645641561472 | 4.425 | 4.724 | 9.079 |
| 4.432787234215062 | 4.428 | 4.727 | 9.083 |
| 4.435928826868651 | 4.43 | 4.731 | 9.087 |
| 4.43907041952224 | 4.433 | 4.734 | 9.091 |
| 4.44221201217583 | 4.436 | 4.737 | 9.095 |
| 4.44535360482942 | 4.439 | 4.741 | 9.099 |
| 4.44849519748301 | 4.442 | 4.744 | 9.103 |
| 4.4516367901366 | 4.445 | 4.747 | 9.107 |
| 4.454778382790188 | 4.447 | 4.751 | 9.111 |
| 4.457919975443779 | 4.45 | 4.754 | 9.115 |
| 4.461061568097368 | 4.453 | 4.757 | 9.119 |
| 4.464203160750958 | 4.456 | 4.761 | 9.123 |
| 4.467344753404547 | 4.459 | 4.764 | 9.127 |
| 4.470486346058137 | 4.462 | 4.767 | 9.131 |
| 4.473627938711726 | 4.465 | 4.77 | 9.135 |
| 4.476769531365316 | 4.467 | 4.774 | 9.139 |
| 4.479911124018905 | 4.47 | 4.777 | 9.142 |
| 4.483052716672495 | 4.473 | 4.78 | 9.146 |
| 4.486194309326085 | 4.476 | 4.784 | 9.15 |
| 4.489335901979674 | 4.479 | 4.787 | 9.154 |
| 4.492477494633264 | 4.482 | 4.79 | 9.158 |
| 4.495619087286854 | 4.485 | 4.793 | 9.162 |
| 4.498760679940443 | 4.488 | 4.797 | 9.165 |
| 4.501902272594033 | 4.491 | 4.8 | 9.169 |
| 4.505043865247622 | 4.493 | 4.803 | 9.173 |
| 4.508185457901212 | 4.496 | 4.807 | 9.177 |
| 4.511327050554801 | 4.499 | 4.81 | 9.18 |
| 4.514468643208391 | 4.502 | 4.813 | 9.184 |
| 4.517610235861981 | 4.505 | 4.816 | 9.188 |
| 4.520751828515571 | 4.508 | 4.82 | 9.192 |
| 4.52389342116916 | 4.511 | 4.823 | 9.195 |
| 4.52703501382275 | 4.514 | 4.826 | 9.199 |
| 4.530176606476339 | 4.517 | 4.829 | 9.203 |
| 4.533318199129928 | 4.52 | 4.833 | 9.206 |
| 4.536459791783518 | 4.523 | 4.836 | 9.21 |
| 4.539601384437108 | 4.526 | 4.839 | 9.214 |
| 4.542742977090698 | 4.528 | 4.842 | 9.217 |
| 4.545884569744287 | 4.531 | 4.846 | 9.221 |
| 4.549026162397876 | 4.534 | 4.849 | 9.224 |
| 4.552167755051466 | 4.537 | 4.852 | 9.228 |
| 4.555309347705056 | 4.54 | 4.855 | 9.232 |
| 4.558450940358646 | 4.543 | 4.859 | 9.235 |
| 4.561592533012235 | 4.546 | 4.862 | 9.239 |
| 4.564734125665825 | 4.549 | 4.865 | 9.242 |
| 4.567875718319415 | 4.552 | 4.868 | 9.246 |
| 4.571017310973004 | 4.555 | 4.872 | 9.249 |
| 4.574158903626594 | 4.558 | 4.875 | 9.253 |
| 4.577300496280183 | 4.561 | 4.878 | 9.257 |
| 4.580442088933772 | 4.564 | 4.881 | 9.26 |
| 4.583583681587362 | 4.567 | 4.885 | 9.264 |
| 4.586725274240952 | 4.57 | 4.888 | 9.267 |
| 4.589866866894542 | 4.573 | 4.891 | 9.271 |
| 4.593008459548131 | 4.576 | 4.894 | 9.274 |
| 4.596150052201721 | 4.579 | 4.897 | 9.277 |
| 4.59929164485531 | 4.582 | 4.901 | 9.281 |
| 4.6024332375089 | 4.585 | 4.904 | 9.284 |
| 4.60557483016249 | 4.588 | 4.907 | 9.288 |
| 4.608716422816079 | 4.591 | 4.91 | 9.291 |
| 4.611858015469668 | 4.594 | 4.914 | 9.295 |
| 4.614999608123258 | 4.597 | 4.917 | 9.298 |
| 4.618141200776848 | 4.6 | 4.92 | 9.301 |
| 4.621282793430437 | 4.603 | 4.923 | 9.305 |
| 4.624424386084027 | 4.606 | 4.926 | 9.308 |
| 4.627565978737617 | 4.609 | 4.93 | 9.312 |
| 4.630707571391206 | 4.612 | 4.933 | 9.315 |
| 4.633849164044795 | 4.615 | 4.936 | 9.318 |
| 4.636990756698386 | 4.618 | 4.939 | 9.322 |
| 4.640132349351975 | 4.621 | 4.942 | 9.325 |
| 4.643273942005564 | 4.624 | 4.945 | 9.328 |
| 4.646415534659154 | 4.628 | 4.949 | 9.332 |
| 4.649557127312744 | 4.631 | 4.952 | 9.335 |
| 4.652698719966334 | 4.634 | 4.955 | 9.338 |
| 4.655840312619923 | 4.637 | 4.958 | 9.342 |
| 4.658981905273513 | 4.64 | 4.961 | 9.345 |
| 4.662123497927102 | 4.643 | 4.965 | 9.348 |
| 4.665265090580692 | 4.646 | 4.968 | 9.351 |
| 4.668406683234282 | 4.649 | 4.971 | 9.355 |
| 4.671548275887871 | 4.652 | 4.974 | 9.358 |
| 4.674689868541461 | 4.655 | 4.977 | 9.361 |
| 4.67783146119505 | 4.658 | 4.98 | 9.364 |
| 4.68097305384864 | 4.661 | 4.984 | 9.368 |
| 4.68411464650223 | 4.665 | 4.987 | 9.371 |
| 4.687256239155819 | 4.668 | 4.99 | 9.374 |
| 4.690397831809409 | 4.671 | 4.993 | 9.377 |
| 4.693539424462998 | 4.674 | 4.996 | 9.38 |
| 4.696681017116588 | 4.677 | 4.999 | 9.384 |
| 4.699822609770177 | 4.68 | 5.002 | 9.387 |
| 4.702964202423767 | 4.683 | 5.006 | 9.39 |
| 4.706105795077356 | 4.686 | 5.009 | 9.393 |
| 4.709247387730946 | 4.689 | 5.012 | 9.396 |
| 4.712388980384535 | 4.693 | 5.015 | 9.399 |
| 4.715530573038126 | 4.696 | 5.018 | 9.403 |
| 4.718672165691715 | 4.699 | 5.021 | 9.406 |
| 4.721813758345305 | 4.702 | 5.024 | 9.409 |
| 4.724955350998894 | 4.705 | 5.028 | 9.412 |
| 4.728096943652484 | 4.708 | 5.031 | 9.415 |
| 4.731238536306074 | 4.712 | 5.034 | 9.418 |
| 4.734380128959663 | 4.715 | 5.037 | 9.421 |
| 4.737521721613253 | 4.718 | 5.04 | 9.424 |
| 4.740663314266842 | 4.721 | 5.043 | 9.427 |
| 4.743804906920432 | 4.724 | 5.046 | 9.431 |
| 4.74694649957402 | 4.727 | 5.05 | 9.434 |
| 4.750088092227611 | 4.731 | 5.053 | 9.437 |
| 4.7532296848812 | 4.734 | 5.056 | 9.44 |
| 4.75637127753479 | 4.737 | 5.059 | 9.443 |
| 4.75951287018838 | 4.74 | 5.062 | 9.446 |
| 4.76265446284197 | 4.743 | 5.065 | 9.449 |
| 4.765796055495559 | 4.747 | 5.068 | 9.452 |
| 4.768937648149149 | 4.75 | 5.071 | 9.455 |
| 4.772079240802738 | 4.753 | 5.074 | 9.458 |
| 4.775220833456327 | 4.756 | 5.078 | 9.461 |
| 4.778362426109917 | 4.759 | 5.081 | 9.464 |
| 4.781504018763507 | 4.763 | 5.084 | 9.467 |
| 4.784645611417097 | 4.766 | 5.087 | 9.47 |
| 4.787787204070686 | 4.769 | 5.09 | 9.473 |
| 4.790928796724275 | 4.772 | 5.093 | 9.476 |
| 4.794070389377865 | 4.776 | 5.096 | 9.479 |
| 4.797211982031455 | 4.779 | 5.099 | 9.482 |
| 4.800353574685045 | 4.782 | 5.102 | 9.484 |
| 4.803495167338634 | 4.785 | 5.105 | 9.487 |
| 4.806636759992224 | 4.789 | 5.108 | 9.49 |
| 4.809778352645814 | 4.792 | 5.112 | 9.493 |
| 4.812919945299403 | 4.795 | 5.115 | 9.496 |
| 4.816061537952993 | 4.799 | 5.118 | 9.499 |
| 4.819203130606582 | 4.802 | 5.121 | 9.502 |
| 4.822344723260172 | 4.805 | 5.124 | 9.505 |
| 4.825486315913761 | 4.808 | 5.127 | 9.508 |
| 4.828627908567351 | 4.812 | 5.13 | 9.511 |
| 4.83176950122094 | 4.815 | 5.133 | 9.513 |
| 4.83491109387453 | 4.818 | 5.136 | 9.516 |
| 4.83805268652812 | 4.822 | 5.139 | 9.519 |
| 4.841194279181709 | 4.825 | 5.142 | 9.522 |
| 4.844335871835299 | 4.828 | 5.145 | 9.525 |
| 4.847477464488889 | 4.832 | 5.148 | 9.528 |
| 4.850619057142478 | 4.835 | 5.151 | 9.531 |
| 4.853760649796068 | 4.838 | 5.154 | 9.533 |
| 4.856902242449657 | 4.841 | 5.158 | 9.536 |
| 4.860043835103247 | 4.845 | 5.161 | 9.539 |
| 4.863185427756837 | 4.848 | 5.164 | 9.542 |
| 4.866327020410426 | 4.852 | 5.167 | 9.545 |
| 4.869468613064015 | 4.855 | 5.17 | 9.547 |
| 4.872610205717605 | 4.858 | 5.173 | 9.55 |
| 4.875751798371195 | 4.862 | 5.176 | 9.553 |
| 4.878893391024784 | 4.865 | 5.179 | 9.556 |
| 4.882034983678374 | 4.868 | 5.182 | 9.559 |
| 4.885176576331964 | 4.872 | 5.185 | 9.561 |
| 4.888318168985553 | 4.875 | 5.188 | 9.564 |
| 4.891459761639143 | 4.878 | 5.191 | 9.567 |
| 4.894601354292733 | 4.882 | 5.194 | 9.57 |
| 4.897742946946322 | 4.885 | 5.197 | 9.572 |
| 4.900884539599912 | 4.889 | 5.2 | 9.575 |
| 4.904026132253501 | 4.892 | 5.203 | 9.578 |
| 4.907167724907091 | 4.895 | 5.206 | 9.581 |
| 4.91030931756068 | 4.899 | 5.209 | 9.583 |
| 4.91345091021427 | 4.902 | 5.212 | 9.586 |
| 4.91659250286786 | 4.906 | 5.215 | 9.589 |
| 4.91973409552145 | 4.909 | 5.218 | 9.591 |
| 4.922875688175039 | 4.912 | 5.221 | 9.594 |
| 4.926017280828628 | 4.916 | 5.224 | 9.597 |
| 4.929158873482218 | 4.919 | 5.227 | 9.599 |
| 4.932300466135808 | 4.923 | 5.23 | 9.602 |
| 4.935442058789397 | 4.926 | 5.233 | 9.605 |
| 4.938583651442987 | 4.93 | 5.236 | 9.607 |
| 4.941725244096576 | 4.933 | 5.239 | 9.61 |
| 4.944866836750166 | 4.937 | 5.242 | 9.613 |
| 4.948008429403755 | 4.94 | 5.245 | 9.615 |
| 4.951150022057345 | 4.944 | 5.248 | 9.618 |
| 4.954291614710935 | 4.947 | 5.251 | 9.621 |
| 4.957433207364524 | 4.95 | 5.254 | 9.623 |
| 4.960574800018114 | 4.954 | 5.257 | 9.626 |
| 4.963716392671704 | 4.957 | 5.26 | 9.629 |
| 4.966857985325293 | 4.961 | 5.263 | 9.631 |
| 4.969999577978883 | 4.964 | 5.266 | 9.634 |
| 4.973141170632472 | 4.968 | 5.269 | 9.636 |
| 4.976282763286062 | 4.971 | 5.272 | 9.639 |
| 4.979424355939651 | 4.975 | 5.275 | 9.642 |
| 4.982565948593241 | 4.978 | 5.278 | 9.644 |
| 4.985707541246831 | 4.982 | 5.281 | 9.647 |
| 4.98884913390042 | 4.985 | 5.284 | 9.649 |
| 4.99199072655401 | 4.989 | 5.287 | 9.652 |
| 4.9951323192076 | 4.993 | 5.29 | 9.655 |
| 4.99827391186119 | 4.996 | 5.293 | 9.657 |
| 5.00141550451478 | 5 | 5.296 | 9.66 |
| 5.004557097168369 | 5.003 | 5.299 | 9.662 |
| 5.007698689821958 | 5.007 | 5.302 | 9.665 |
| 5.010840282475548 | 5.01 | 5.305 | 9.667 |
| 5.013981875129137 | 5.014 | 5.308 | 9.67 |
| 5.017123467782727 | 5.017 | 5.311 | 9.672 |
| 5.020265060436317 | 5.021 | 5.314 | 9.675 |
| 5.023406653089906 | 5.025 | 5.317 | 9.677 |
| 5.026548245743496 | 5.028 | 5.32 | 9.68 |
| 5.029689838397085 | 5.032 | 5.323 | 9.682 |
| 5.032831431050674 | 5.035 | 5.326 | 9.685 |
| 5.035973023704264 | 5.039 | 5.329 | 9.687 |
| 5.039114616357854 | 5.043 | 5.332 | 9.69 |
| 5.042256209011444 | 5.046 | 5.335 | 9.692 |
| 5.045397801665033 | 5.05 | 5.338 | 9.695 |
| 5.048539394318622 | 5.053 | 5.341 | 9.697 |
| 5.051680986972213 | 5.057 | 5.343 | 9.7 |
| 5.054822579625802 | 5.061 | 5.346 | 9.702 |
| 5.057964172279392 | 5.064 | 5.349 | 9.705 |
| 5.061105764932981 | 5.068 | 5.352 | 9.707 |
| 5.064247357586571 | 5.072 | 5.355 | 9.71 |
| 5.067388950240161 | 5.075 | 5.358 | 9.712 |
| 5.07053054289375 | 5.079 | 5.361 | 9.715 |
| 5.07367213554734 | 5.082 | 5.364 | 9.717 |
| 5.07681372820093 | 5.086 | 5.367 | 9.72 |
| 5.079955320854519 | 5.09 | 5.37 | 9.722 |
| 5.083096913508108 | 5.093 | 5.373 | 9.725 |
| 5.086238506161698 | 5.097 | 5.376 | 9.727 |
| 5.089380098815288 | 5.101 | 5.379 | 9.729 |
| 5.092521691468877 | 5.105 | 5.382 | 9.732 |
| 5.095663284122466 | 5.108 | 5.385 | 9.734 |
| 5.098804876776057 | 5.112 | 5.387 | 9.737 |
| 5.101946469429646 | 5.116 | 5.39 | 9.739 |
| 5.105088062083236 | 5.119 | 5.393 | 9.741 |
| 5.108229654736825 | 5.123 | 5.396 | 9.744 |
| 5.111371247390415 | 5.127 | 5.399 | 9.746 |
| 5.114512840044005 | 5.13 | 5.402 | 9.749 |
| 5.117654432697594 | 5.134 | 5.405 | 9.751 |
| 5.120796025351184 | 5.138 | 5.408 | 9.753 |
| 5.123937618004773 | 5.142 | 5.411 | 9.756 |
| 5.127079210658363 | 5.145 | 5.414 | 9.758 |
| 5.130220803311953 | 5.149 | 5.417 | 9.761 |
| 5.133362395965542 | 5.153 | 5.419 | 9.763 |
| 5.136503988619131 | 5.157 | 5.422 | 9.765 |
| 5.13964558127272 | 5.16 | 5.425 | 9.768 |
| 5.142787173926311 | 5.164 | 5.428 | 9.77 |
| 5.1459287665799 | 5.168 | 5.431 | 9.772 |
| 5.14907035923349 | 5.172 | 5.434 | 9.775 |
| 5.15221195188708 | 5.176 | 5.437 | 9.777 |
| 5.15535354454067 | 5.179 | 5.44 | 9.779 |
| 5.158495137194259 | 5.183 | 5.443 | 9.782 |
| 5.161636729847848 | 5.187 | 5.446 | 9.784 |
| 5.164778322501438 | 5.191 | 5.448 | 9.786 |
| 5.167919915155028 | 5.195 | 5.451 | 9.789 |
| 5.171061507808617 | 5.198 | 5.454 | 9.791 |
| 5.174203100462206 | 5.202 | 5.457 | 9.793 |
| 5.177344693115796 | 5.206 | 5.46 | 9.796 |
| 5.180486285769386 | 5.21 | 5.463 | 9.798 |
| 5.183627878422976 | 5.214 | 5.466 | 9.8 |
| 5.186769471076565 | 5.218 | 5.469 | 9.803 |
| 5.189911063730155 | 5.221 | 5.472 | 9.805 |
| 5.193052656383744 | 5.225 | 5.474 | 9.807 |
| 5.196194249037334 | 5.229 | 5.477 | 9.81 |
| 5.199335841690924 | 5.233 | 5.48 | 9.812 |
| 5.202477434344513 | 5.237 | 5.483 | 9.814 |
| 5.205619026998103 | 5.241 | 5.486 | 9.816 |
| 5.208760619651692 | 5.245 | 5.489 | 9.819 |
| 5.211902212305282 | 5.248 | 5.492 | 9.821 |
| 5.215043804958871 | 5.252 | 5.494 | 9.823 |
| 5.218185397612461 | 5.256 | 5.497 | 9.825 |
| 5.221326990266051 | 5.26 | 5.5 | 9.828 |
| 5.22446858291964 | 5.264 | 5.503 | 9.83 |
| 5.22761017557323 | 5.268 | 5.506 | 9.832 |
| 5.23075176822682 | 5.272 | 5.509 | 9.834 |
| 5.23389336088041 | 5.276 | 5.512 | 9.837 |
| 5.237034953533999 | 5.28 | 5.515 | 9.839 |
| 5.240176546187588 | 5.284 | 5.517 | 9.841 |
| 5.243318138841178 | 5.288 | 5.52 | 9.843 |
| 5.246459731494767 | 5.292 | 5.523 | 9.846 |
| 5.249601324148357 | 5.295 | 5.526 | 9.848 |
| 5.252742916801947 | 5.299 | 5.529 | 9.85 |
| 5.255884509455536 | 5.303 | 5.532 | 9.852 |
| 5.259026102109125 | 5.307 | 5.534 | 9.855 |
| 5.262167694762715 | 5.311 | 5.537 | 9.857 |
| 5.265309287416305 | 5.315 | 5.54 | 9.859 |
| 5.268450880069895 | 5.319 | 5.543 | 9.861 |
| 5.271592472723484 | 5.323 | 5.546 | 9.863 |
| 5.274734065377074 | 5.327 | 5.549 | 9.866 |
| 5.277875658030664 | 5.331 | 5.552 | 9.868 |
| 5.281017250684253 | 5.335 | 5.554 | 9.87 |
| 5.284158843337843 | 5.339 | 5.557 | 9.872 |
| 5.287300435991432 | 5.343 | 5.56 | 9.874 |
| 5.290442028645022 | 5.347 | 5.563 | 9.877 |
| 5.293583621298612 | 5.351 | 5.566 | 9.879 |
| 5.296725213952201 | 5.355 | 5.569 | 9.881 |
| 5.299866806605791 | 5.359 | 5.571 | 9.883 |
| 5.30300839925938 | 5.363 | 5.574 | 9.885 |
| 5.30614999191297 | 5.367 | 5.577 | 9.888 |
| 5.30929158456656 | 5.371 | 5.58 | 9.89 |
| 5.312433177220149 | 5.376 | 5.583 | 9.892 |
| 5.315574769873739 | 5.38 | 5.585 | 9.894 |
| 5.318716362527328 | 5.384 | 5.588 | 9.896 |
| 5.321857955180918 | 5.388 | 5.591 | 9.898 |
| 5.324999547834508 | 5.392 | 5.594 | 9.9 |
| 5.328141140488097 | 5.396 | 5.597 | 9.903 |
| 5.331282733141686 | 5.4 | 5.6 | 9.905 |
| 5.334424325795276 | 5.404 | 5.602 | 9.907 |
| 5.337565918448866 | 5.408 | 5.605 | 9.909 |
| 5.340707511102456 | 5.412 | 5.608 | 9.911 |
| 5.343849103756045 | 5.416 | 5.611 | 9.913 |
| 5.346990696409634 | 5.421 | 5.614 | 9.915 |
| 5.350132289063224 | 5.425 | 5.616 | 9.918 |
| 5.353273881716814 | 5.429 | 5.619 | 9.92 |
| 5.356415474370403 | 5.433 | 5.622 | 9.922 |
| 5.359557067023993 | 5.437 | 5.625 | 9.924 |
| 5.362698659677583 | 5.441 | 5.628 | 9.926 |
| 5.365840252331172 | 5.445 | 5.63 | 9.928 |
| 5.368981844984762 | 5.449 | 5.633 | 9.93 |
| 5.372123437638351 | 5.454 | 5.636 | 9.932 |
| 5.375265030291941 | 5.458 | 5.639 | 9.935 |
| 5.378406622945531 | 5.462 | 5.642 | 9.937 |
| 5.38154821559912 | 5.466 | 5.644 | 9.939 |
| 5.38468980825271 | 5.47 | 5.647 | 9.941 |
| 5.387831400906299 | 5.474 | 5.65 | 9.943 |
| 5.39097299355989 | 5.479 | 5.653 | 9.945 |
| 5.394114586213479 | 5.483 | 5.656 | 9.947 |
| 5.397256178867068 | 5.487 | 5.658 | 9.949 |
| 5.400397771520657 | 5.491 | 5.661 | 9.951 |
| 5.403539364174247 | 5.496 | 5.664 | 9.953 |
| 5.406680956827837 | 5.5 | 5.667 | 9.955 |
| 5.409822549481426 | 5.504 | 5.67 | 9.958 |
| 5.412964142135016 | 5.508 | 5.672 | 9.96 |
| 5.416105734788605 | 5.512 | 5.675 | 9.962 |
| 5.419247327442195 | 5.517 | 5.678 | 9.964 |
| 5.422388920095785 | 5.521 | 5.681 | 9.966 |
| 5.425530512749375 | 5.525 | 5.683 | 9.968 |
| 5.428672105402964 | 5.529 | 5.686 | 9.97 |
| 5.431813698056554 | 5.534 | 5.689 | 9.972 |
| 5.434955290710143 | 5.538 | 5.692 | 9.974 |
| 5.438096883363733 | 5.542 | 5.695 | 9.976 |
| 5.441238476017322 | 5.547 | 5.697 | 9.978 |
| 5.444380068670912 | 5.551 | 5.7 | 9.98 |
| 5.447521661324502 | 5.555 | 5.703 | 9.982 |
| 5.450663253978091 | 5.559 | 5.706 | 9.984 |
| 5.453804846631681 | 5.564 | 5.708 | 9.986 |
| 5.456946439285271 | 5.568 | 5.711 | 9.988 |
| 5.46008803193886 | 5.572 | 5.714 | 9.99 |
| 5.46322962459245 | 5.577 | 5.717 | 9.992 |
| 5.466371217246039 | 5.581 | 5.719 | 9.994 |
| 5.46951280989963 | 5.585 | 5.722 | 9.996 |
| 5.472654402553218 | 5.59 | 5.725 | 9.999 |
| 5.475795995206808 | 5.594 | 5.728 | 10.001 |
| 5.478937587860398 | 5.598 | 5.731 | 10.003 |
| 5.482079180513987 | 5.603 | 5.733 | 10.005 |
| 5.485220773167577 | 5.607 | 5.736 | 10.007 |
| 5.488362365821166 | 5.611 | 5.739 | 10.009 |
| 5.491503958474756 | 5.616 | 5.742 | 10.011 |
| 5.494645551128346 | 5.62 | 5.744 | 10.013 |
| 5.497787143781935 | 5.624 | 5.747 | 10.015 |
| 5.500928736435525 | 5.629 | 5.75 | 10.017 |
| 5.504070329089115 | 5.633 | 5.753 | 10.019 |
| 5.507211921742704 | 5.638 | 5.755 | 10.021 |
| 5.510353514396294 | 5.642 | 5.758 | 10.023 |
| 5.513495107049883 | 5.646 | 5.761 | 10.025 |
| 5.516636699703473 | 5.651 | 5.764 | 10.027 |
| 5.519778292357062 | 5.655 | 5.766 | 10.029 |
| 5.522919885010652 | 5.66 | 5.769 | 10.031 |
| 5.526061477664242 | 5.664 | 5.772 | 10.033 |
| 5.529203070317831 | 5.669 | 5.775 | 10.035 |
| 5.532344662971421 | 5.673 | 5.777 | 10.037 |
| 5.535486255625011 | 5.677 | 5.78 | 10.039 |
| 5.5386278482786 | 5.682 | 5.783 | 10.041 |
| 5.54176944093219 | 5.686 | 5.785 | 10.043 |
| 5.544911033585779 | 5.691 | 5.788 | 10.044 |
| 5.54805262623937 | 5.695 | 5.791 | 10.046 |
| 5.551194218892959 | 5.7 | 5.794 | 10.048 |
| 5.554335811546548 | 5.704 | 5.796 | 10.05 |
| 5.557477404200137 | 5.709 | 5.799 | 10.052 |
| 5.560618996853727 | 5.713 | 5.802 | 10.054 |
| 5.563760589507317 | 5.718 | 5.805 | 10.056 |
| 5.566902182160906 | 5.722 | 5.807 | 10.058 |
| 5.570043774814496 | 5.727 | 5.81 | 10.06 |
| 5.573185367468086 | 5.731 | 5.813 | 10.062 |
| 5.576326960121675 | 5.736 | 5.816 | 10.064 |
| 5.579468552775264 | 5.74 | 5.818 | 10.066 |
| 5.582610145428854 | 5.745 | 5.821 | 10.068 |
| 5.585751738082444 | 5.749 | 5.824 | 10.07 |
| 5.588893330736034 | 5.754 | 5.826 | 10.072 |
| 5.592034923389623 | 5.758 | 5.829 | 10.074 |
| 5.595176516043213 | 5.763 | 5.832 | 10.076 |
| 5.598318108696803 | 5.767 | 5.835 | 10.078 |
| 5.601459701350392 | 5.772 | 5.837 | 10.08 |
| 5.604601294003982 | 5.777 | 5.84 | 10.082 |
| 5.607742886657571 | 5.781 | 5.843 | 10.084 |
| 5.610884479311161 | 5.786 | 5.845 | 10.085 |
| 5.61402607196475 | 5.79 | 5.848 | 10.087 |
| 5.61716766461834 | 5.795 | 5.851 | 10.089 |
| 5.62030925727193 | 5.799 | 5.854 | 10.091 |
| 5.623450849925519 | 5.804 | 5.856 | 10.093 |
| 5.626592442579109 | 5.809 | 5.859 | 10.095 |
| 5.629734035232698 | 5.813 | 5.862 | 10.097 |
| 5.632875627886288 | 5.818 | 5.864 | 10.099 |
| 5.636017220539878 | 5.822 | 5.867 | 10.101 |
| 5.639158813193467 | 5.827 | 5.87 | 10.103 |
| 5.642300405847057 | 5.832 | 5.873 | 10.105 |
| 5.645441998500646 | 5.836 | 5.875 | 10.107 |
| 5.648583591154236 | 5.841 | 5.878 | 10.109 |
| 5.651725183807825 | 5.846 | 5.881 | 10.11 |
| 5.654866776461415 | 5.85 | 5.883 | 10.112 |
| 5.658008369115005 | 5.855 | 5.886 | 10.114 |
| 5.661149961768594 | 5.859 | 5.889 | 10.116 |
| 5.664291554422184 | 5.864 | 5.892 | 10.118 |
| 5.667433147075774 | 5.869 | 5.894 | 10.12 |
| 5.670574739729363 | 5.873 | 5.897 | 10.122 |
| 5.673716332382953 | 5.878 | 5.9 | 10.124 |
| 5.676857925036542 | 5.883 | 5.902 | 10.126 |
| 5.679999517690132 | 5.888 | 5.905 | 10.128 |
| 5.683141110343721 | 5.892 | 5.908 | 10.129 |
| 5.686282702997311 | 5.897 | 5.91 | 10.131 |
| 5.689424295650901 | 5.902 | 5.913 | 10.133 |
| 5.69256588830449 | 5.906 | 5.916 | 10.135 |
| 5.69570748095808 | 5.911 | 5.918 | 10.137 |
| 5.69884907361167 | 5.916 | 5.921 | 10.139 |
| 5.701990666265259 | 5.92 | 5.924 | 10.141 |
| 5.705132258918849 | 5.925 | 5.927 | 10.143 |
| 5.708273851572438 | 5.93 | 5.929 | 10.145 |
| 5.711415444226028 | 5.935 | 5.932 | 10.146 |
| 5.714557036879618 | 5.939 | 5.935 | 10.148 |
| 5.717698629533207 | 5.944 | 5.937 | 10.15 |
| 5.720840222186797 | 5.949 | 5.94 | 10.152 |
| 5.723981814840386 | 5.954 | 5.943 | 10.154 |
| 5.727123407493976 | 5.958 | 5.945 | 10.156 |
| 5.730265000147565 | 5.963 | 5.948 | 10.158 |
| 5.733406592801155 | 5.968 | 5.951 | 10.16 |
| 5.736548185454744 | 5.973 | 5.953 | 10.161 |
| 5.739689778108334 | 5.977 | 5.956 | 10.163 |
| 5.742831370761924 | 5.982 | 5.959 | 10.165 |
| 5.745972963415514 | 5.987 | 5.961 | 10.167 |
| 5.749114556069103 | 5.992 | 5.964 | 10.169 |
| 5.752256148722693 | 5.997 | 5.967 | 10.171 |
| 5.755397741376282 | 6.001 | 5.97 | 10.173 |
| 5.758539334029872 | 6.006 | 5.972 | 10.174 |
| 5.761680926683462 | 6.011 | 5.975 | 10.176 |
| 5.764822519337051 | 6.016 | 5.978 | 10.178 |
| 5.767964111990641 | 6.021 | 5.98 | 10.18 |
| 5.77110570464423 | 6.025 | 5.983 | 10.182 |
| 5.77424729729782 | 6.03 | 5.986 | 10.184 |
| 5.77738888995141 | 6.035 | 5.988 | 10.186 |
| 5.780530482605 | 6.04 | 5.991 | 10.187 |
| 5.783672075258588 | 6.045 | 5.994 | 10.189 |
| 5.786813667912178 | 6.05 | 5.996 | 10.191 |
| 5.789955260565768 | 6.054 | 5.999 | 10.193 |
| 5.793096853219358 | 6.059 | 6.002 | 10.195 |
| 5.796238445872947 | 6.064 | 6.004 | 10.197 |
| 5.799380038526537 | 6.069 | 6.007 | 10.198 |
| 5.802521631180126 | 6.074 | 6.01 | 10.2 |
| 5.805663223833715 | 6.079 | 6.012 | 10.202 |
| 5.808804816487306 | 6.084 | 6.015 | 10.204 |
| 5.811946409140895 | 6.088 | 6.018 | 10.206 |
| 5.815088001794485 | 6.093 | 6.02 | 10.208 |
| 5.818229594448074 | 6.098 | 6.023 | 10.209 |
| 5.821371187101663 | 6.103 | 6.026 | 10.211 |
| 5.824512779755254 | 6.108 | 6.028 | 10.213 |
| 5.827654372408843 | 6.113 | 6.031 | 10.215 |
| 5.830795965062433 | 6.118 | 6.034 | 10.217 |
| 5.833937557716022 | 6.123 | 6.036 | 10.219 |
| 5.837079150369612 | 6.128 | 6.039 | 10.22 |
| 5.840220743023201 | 6.133 | 6.042 | 10.222 |
| 5.843362335676791 | 6.138 | 6.044 | 10.224 |
| 5.846503928330381 | 6.142 | 6.047 | 10.226 |
| 5.84964552098397 | 6.147 | 6.05 | 10.228 |
| 5.85278711363756 | 6.152 | 6.052 | 10.23 |
| 5.85592870629115 | 6.157 | 6.055 | 10.231 |
| 5.85907029894474 | 6.162 | 6.058 | 10.233 |
| 5.862211891598329 | 6.167 | 6.06 | 10.235 |
| 5.865353484251918 | 6.172 | 6.063 | 10.237 |
| 5.868495076905508 | 6.177 | 6.066 | 10.239 |
| 5.871636669559098 | 6.182 | 6.068 | 10.24 |
| 5.874778262212687 | 6.187 | 6.071 | 10.242 |
| 5.877919854866277 | 6.192 | 6.073 | 10.244 |
| 5.881061447519866 | 6.197 | 6.076 | 10.246 |
| 5.884203040173456 | 6.202 | 6.079 | 10.248 |
| 5.887344632827046 | 6.207 | 6.081 | 10.249 |
| 5.890486225480635 | 6.212 | 6.084 | 10.251 |
| 5.893627818134224 | 6.217 | 6.087 | 10.253 |
| 5.896769410787814 | 6.222 | 6.089 | 10.255 |
| 5.899911003441404 | 6.227 | 6.092 | 10.257 |
| 5.903052596094994 | 6.232 | 6.095 | 10.259 |
| 5.906194188748583 | 6.237 | 6.097 | 10.26 |
| 5.909335781402172 | 6.242 | 6.1 | 10.262 |
| 5.912477374055762 | 6.247 | 6.103 | 10.264 |
| 5.915618966709352 | 6.252 | 6.105 | 10.266 |
| 5.918760559362942 | 6.257 | 6.108 | 10.268 |
| 5.921902152016531 | 6.262 | 6.111 | 10.269 |
| 5.92504374467012 | 6.267 | 6.113 | 10.271 |
| 5.92818533732371 | 6.272 | 6.116 | 10.273 |
| 5.9313269299773 | 6.277 | 6.119 | 10.275 |
| 5.93446852263089 | 6.282 | 6.121 | 10.276 |
| 5.93761011528448 | 6.287 | 6.124 | 10.278 |
| 5.940751707938068 | 6.292 | 6.126 | 10.28 |
| 5.943893300591658 | 6.297 | 6.129 | 10.282 |
| 5.947034893245248 | 6.302 | 6.132 | 10.284 |
| 5.950176485898837 | 6.307 | 6.134 | 10.285 |
| 5.953318078552427 | 6.312 | 6.137 | 10.287 |
| 5.956459671206017 | 6.317 | 6.14 | 10.289 |
| 5.959601263859606 | 6.322 | 6.142 | 10.291 |
| 5.962742856513196 | 6.327 | 6.145 | 10.293 |
| 5.965884449166785 | 6.332 | 6.148 | 10.294 |
| 5.969026041820375 | 6.338 | 6.15 | 10.296 |
| 5.972167634473964 | 6.343 | 6.153 | 10.298 |
| 5.975309227127554 | 6.348 | 6.156 | 10.3 |
| 5.978450819781144 | 6.353 | 6.158 | 10.302 |
| 5.981592412434733 | 6.358 | 6.161 | 10.303 |
| 5.984734005088323 | 6.363 | 6.163 | 10.305 |
| 5.987875597741913 | 6.368 | 6.166 | 10.307 |
| 5.991017190395502 | 6.373 | 6.169 | 10.309 |
| 5.994158783049092 | 6.378 | 6.171 | 10.31 |
| 5.997300375702681 | 6.383 | 6.174 | 10.312 |
| 6.000441968356271 | 6.388 | 6.177 | 10.314 |
| 6.003583561009861 | 6.393 | 6.179 | 10.316 |
| 6.00672515366345 | 6.399 | 6.182 | 10.318 |
| 6.00986674631704 | 6.404 | 6.185 | 10.319 |
| 6.01300833897063 | 6.409 | 6.187 | 10.321 |
| 6.01614993162422 | 6.414 | 6.19 | 10.323 |
| 6.019291524277808 | 6.419 | 6.192 | 10.325 |
| 6.022433116931398 | 6.424 | 6.195 | 10.326 |
| 6.025574709584988 | 6.429 | 6.198 | 10.328 |
| 6.028716302238577 | 6.434 | 6.2 | 10.33 |
| 6.031857894892167 | 6.44 | 6.203 | 10.332 |
| 6.034999487545757 | 6.445 | 6.206 | 10.333 |
| 6.038141080199346 | 6.45 | 6.208 | 10.335 |
| 6.041282672852935 | 6.455 | 6.211 | 10.337 |
| 6.044424265506525 | 6.46 | 6.213 | 10.339 |
| 6.047565858160115 | 6.465 | 6.216 | 10.341 |
| 6.050707450813704 | 6.47 | 6.219 | 10.342 |
| 6.053849043467294 | 6.475 | 6.221 | 10.344 |
| 6.056990636120884 | 6.481 | 6.224 | 10.346 |
| 6.060132228774473 | 6.486 | 6.227 | 10.348 |
| 6.063273821428063 | 6.491 | 6.229 | 10.349 |
| 6.066415414081653 | 6.496 | 6.232 | 10.351 |
| 6.069557006735242 | 6.501 | 6.234 | 10.353 |
| 6.072698599388831 | 6.506 | 6.237 | 10.355 |
| 6.07584019204242 | 6.512 | 6.24 | 10.356 |
| 6.078981784696011 | 6.517 | 6.242 | 10.358 |
| 6.082123377349601 | 6.522 | 6.245 | 10.36 |
| 6.08526497000319 | 6.527 | 6.248 | 10.362 |
| 6.08840656265678 | 6.532 | 6.25 | 10.363 |
| 6.09154815531037 | 6.537 | 6.253 | 10.365 |
| 6.094689747963959 | 6.543 | 6.256 | 10.367 |
| 6.097831340617549 | 6.548 | 6.258 | 10.369 |
| 6.100972933271138 | 6.553 | 6.261 | 10.37 |
| 6.104114525924728 | 6.558 | 6.263 | 10.372 |
| 6.107256118578317 | 6.563 | 6.266 | 10.374 |
| 6.110397711231907 | 6.568 | 6.269 | 10.376 |
| 6.113539303885497 | 6.574 | 6.271 | 10.378 |
| 6.116680896539086 | 6.579 | 6.274 | 10.379 |
| 6.119822489192675 | 6.584 | 6.277 | 10.381 |
| 6.122964081846265 | 6.589 | 6.279 | 10.383 |
| 6.126105674499855 | 6.594 | 6.282 | 10.385 |
| 6.129247267153445 | 6.6 | 6.284 | 10.386 |
| 6.132388859807034 | 6.605 | 6.287 | 10.388 |
| 6.135530452460624 | 6.61 | 6.29 | 10.39 |
| 6.138672045114213 | 6.615 | 6.292 | 10.392 |
| 6.141813637767803 | 6.62 | 6.295 | 10.393 |
| 6.144955230421393 | 6.626 | 6.297 | 10.395 |
| 6.148096823074982 | 6.631 | 6.3 | 10.397 |
| 6.151238415728571 | 6.636 | 6.303 | 10.399 |
| 6.154380008382161 | 6.641 | 6.305 | 10.4 |
| 6.157521601035751 | 6.646 | 6.308 | 10.402 |
| 6.16066319368934 | 6.652 | 6.311 | 10.404 |
| 6.16380478634293 | 6.657 | 6.313 | 10.406 |
| 6.16694637899652 | 6.662 | 6.316 | 10.407 |
| 6.170087971650109 | 6.667 | 6.318 | 10.409 |
| 6.173229564303698 | 6.673 | 6.321 | 10.411 |
| 6.176371156957289 | 6.678 | 6.324 | 10.413 |
| 6.179512749610878 | 6.683 | 6.326 | 10.414 |
| 6.182654342264468 | 6.688 | 6.329 | 10.416 |
| 6.185795934918057 | 6.693 | 6.332 | 10.418 |
| 6.188937527571647 | 6.699 | 6.334 | 10.42 |
| 6.192079120225237 | 6.704 | 6.337 | 10.421 |
| 6.195220712878826 | 6.709 | 6.339 | 10.423 |
| 6.198362305532415 | 6.714 | 6.342 | 10.425 |
| 6.201503898186005 | 6.719 | 6.345 | 10.427 |
| 6.204645490839594 | 6.725 | 6.347 | 10.428 |
| 6.207787083493184 | 6.73 | 6.35 | 10.43 |
| 6.210928676146774 | 6.735 | 6.353 | 10.432 |
| 6.214070268800364 | 6.74 | 6.355 | 10.434 |
| 6.217211861453953 | 6.746 | 6.358 | 10.435 |
| 6.220353454107543 | 6.751 | 6.36 | 10.437 |
| 6.223495046761133 | 6.756 | 6.363 | 10.439 |
| 6.226636639414722 | 6.761 | 6.366 | 10.441 |
| 6.229778232068312 | 6.767 | 6.368 | 10.442 |
| 6.232919824721901 | 6.772 | 6.371 | 10.444 |
| 6.236061417375491 | 6.777 | 6.373 | 10.446 |
| 6.23920301002908 | 6.782 | 6.376 | 10.448 |
| 6.24234460268267 | 6.787 | 6.379 | 10.449 |
| 6.24548619533626 | 6.793 | 6.381 | 10.451 |
| 6.24862778798985 | 6.798 | 6.384 | 10.453 |
| 6.251769380643438 | 6.803 | 6.387 | 10.455 |
| 6.254910973297028 | 6.808 | 6.389 | 10.456 |
| 6.258052565950618 | 6.814 | 6.392 | 10.458 |
| 6.261194158604208 | 6.819 | 6.394 | 10.46 |
| 6.264335751257797 | 6.824 | 6.397 | 10.462 |
| 6.267477343911387 | 6.829 | 6.4 | 10.463 |
| 6.270618936564976 | 6.835 | 6.402 | 10.465 |
| 6.273760529218566 | 6.84 | 6.405 | 10.467 |
| 6.276902121872155 | 6.845 | 6.408 | 10.468 |
| 6.280043714525745 | 6.85 | 6.41 | 10.47 |
| 6.283185307179335 | 6.856 | 6.413 | 10.472 |